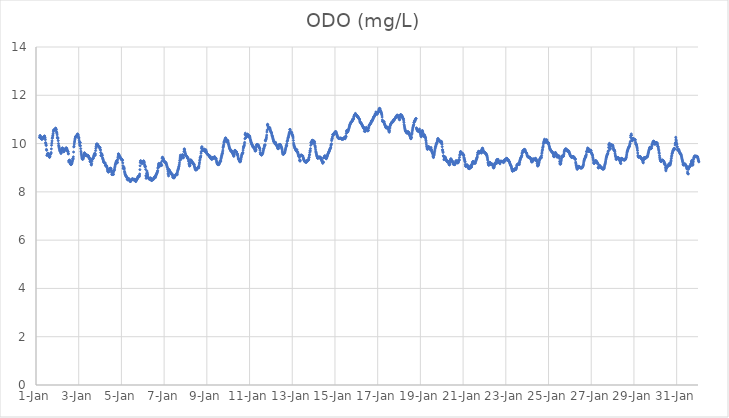
| Category | ODO (mg/L) |
|---|---|
| 44927.166666666664 | 10.25 |
| 44927.177083333336 | 10.27 |
| 44927.1875 | 10.33 |
| 44927.197916666664 | 10.33 |
| 44927.208333333336 | 10.29 |
| 44927.21875 | 10.25 |
| 44927.229166666664 | 10.24 |
| 44927.239583333336 | 10.22 |
| 44927.25 | 10.2 |
| 44927.260416666664 | 10.19 |
| 44927.270833333336 | 10.18 |
| 44927.28125 | 10.19 |
| 44927.291666666664 | 10.19 |
| 44927.302083333336 | 10.2 |
| 44927.3125 | 10.22 |
| 44927.322916666664 | 10.23 |
| 44927.333333333336 | 10.24 |
| 44927.34375 | 10.26 |
| 44927.354166666664 | 10.27 |
| 44927.364583333336 | 10.29 |
| 44927.375 | 10.29 |
| 44927.385416666664 | 10.28 |
| 44927.395833333336 | 10.31 |
| 44927.40625 | 10.31 |
| 44927.416666666664 | 10.26 |
| 44927.427083333336 | 10.23 |
| 44927.4375 | 10.16 |
| 44927.447916666664 | 10.04 |
| 44927.458333333336 | 10.01 |
| 44927.46875 | 9.95 |
| 44927.479166666664 | 9.92 |
| 44927.489583333336 | 9.76 |
| 44927.5 | 9.72 |
| 44927.510416666664 | 9.51 |
| 44927.520833333336 | 9.52 |
| 44927.53125 | 9.57 |
| 44927.541666666664 | 9.54 |
| 44927.552083333336 | 9.56 |
| 44927.5625 | 9.6 |
| 44927.572916666664 | 9.57 |
| 44927.583333333336 | 9.55 |
| 44927.59375 | 9.51 |
| 44927.604166666664 | 9.49 |
| 44927.614583333336 | 9.46 |
| 44927.625 | 9.44 |
| 44927.635416666664 | 9.43 |
| 44927.645833333336 | 9.45 |
| 44927.65625 | 9.48 |
| 44927.666666666664 | 9.54 |
| 44927.677083333336 | 9.57 |
| 44927.6875 | 9.59 |
| 44927.697916666664 | 9.58 |
| 44927.708333333336 | 9.63 |
| 44927.71875 | 9.78 |
| 44927.729166666664 | 9.93 |
| 44927.739583333336 | 10.02 |
| 44927.75 | 10.11 |
| 44927.760416666664 | 10.22 |
| 44927.770833333336 | 10.24 |
| 44927.78125 | 10.31 |
| 44927.791666666664 | 10.35 |
| 44927.802083333336 | 10.41 |
| 44927.8125 | 10.49 |
| 44927.822916666664 | 10.55 |
| 44927.833333333336 | 10.56 |
| 44927.84375 | 10.56 |
| 44927.854166666664 | 10.57 |
| 44927.864583333336 | 10.57 |
| 44927.875 | 10.58 |
| 44927.885416666664 | 10.59 |
| 44927.895833333336 | 10.61 |
| 44927.90625 | 10.6 |
| 44927.916666666664 | 10.64 |
| 44927.927083333336 | 10.63 |
| 44927.9375 | 10.58 |
| 44927.947916666664 | 10.58 |
| 44927.958333333336 | 10.5 |
| 44927.96875 | 10.45 |
| 44927.979166666664 | 10.43 |
| 44927.989583333336 | 10.36 |
| 44928.0 | 10.26 |
| 44928.010416666664 | 10.22 |
| 44928.020833333336 | 10.23 |
| 44928.03125 | 10.23 |
| 44928.041666666664 | 10.12 |
| 44928.052083333336 | 10 |
| 44928.0625 | 9.92 |
| 44928.072916666664 | 9.88 |
| 44928.083333333336 | 9.84 |
| 44928.09375 | 9.8 |
| 44928.104166666664 | 9.75 |
| 44928.114583333336 | 9.71 |
| 44928.125 | 9.69 |
| 44928.135416666664 | 9.67 |
| 44928.145833333336 | 9.67 |
| 44928.15625 | 9.66 |
| 44928.166666666664 | 9.59 |
| 44928.177083333336 | 9.61 |
| 44928.1875 | 9.63 |
| 44928.197916666664 | 9.74 |
| 44928.208333333336 | 9.75 |
| 44928.21875 | 9.8 |
| 44928.229166666664 | 9.81 |
| 44928.239583333336 | 9.82 |
| 44928.25 | 9.8 |
| 44928.260416666664 | 9.74 |
| 44928.270833333336 | 9.74 |
| 44928.28125 | 9.72 |
| 44928.291666666664 | 9.67 |
| 44928.302083333336 | 9.66 |
| 44928.3125 | 9.67 |
| 44928.322916666664 | 9.7 |
| 44928.333333333336 | 9.73 |
| 44928.34375 | 9.75 |
| 44928.354166666664 | 9.76 |
| 44928.364583333336 | 9.77 |
| 44928.375 | 9.77 |
| 44928.385416666664 | 9.79 |
| 44928.395833333336 | 9.81 |
| 44928.40625 | 9.81 |
| 44928.416666666664 | 9.82 |
| 44928.427083333336 | 9.81 |
| 44928.4375 | 9.8 |
| 44928.447916666664 | 9.71 |
| 44928.458333333336 | 9.76 |
| 44928.46875 | 9.71 |
| 44928.479166666664 | 9.68 |
| 44928.489583333336 | 9.66 |
| 44928.5 | 9.67 |
| 44928.510416666664 | 9.57 |
| 44928.520833333336 | 9.59 |
| 44928.53125 | 9.24 |
| 44928.541666666664 | 9.29 |
| 44928.552083333336 | 9.29 |
| 44928.5625 | 9.3 |
| 44928.572916666664 | 9.32 |
| 44928.583333333336 | 9.28 |
| 44928.59375 | 9.24 |
| 44928.604166666664 | 9.19 |
| 44928.614583333336 | 9.16 |
| 44928.625 | 9.14 |
| 44928.635416666664 | 9.13 |
| 44928.645833333336 | 9.13 |
| 44928.65625 | 9.14 |
| 44928.666666666664 | 9.16 |
| 44928.677083333336 | 9.17 |
| 44928.6875 | 9.23 |
| 44928.697916666664 | 9.25 |
| 44928.708333333336 | 9.3 |
| 44928.71875 | 9.38 |
| 44928.729166666664 | 9.35 |
| 44928.739583333336 | 9.37 |
| 44928.75 | 9.45 |
| 44928.760416666664 | 9.65 |
| 44928.770833333336 | 9.86 |
| 44928.78125 | 9.89 |
| 44928.791666666664 | 9.98 |
| 44928.802083333336 | 10.06 |
| 44928.8125 | 10.11 |
| 44928.822916666664 | 10.18 |
| 44928.833333333336 | 10.22 |
| 44928.84375 | 10.27 |
| 44928.854166666664 | 10.28 |
| 44928.864583333336 | 10.28 |
| 44928.875 | 10.3 |
| 44928.885416666664 | 10.32 |
| 44928.895833333336 | 10.31 |
| 44928.90625 | 10.31 |
| 44928.916666666664 | 10.33 |
| 44928.927083333336 | 10.36 |
| 44928.9375 | 10.38 |
| 44928.947916666664 | 10.4 |
| 44928.958333333336 | 10.38 |
| 44928.96875 | 10.37 |
| 44928.979166666664 | 10.32 |
| 44928.989583333336 | 10.27 |
| 44929.0 | 10.22 |
| 44929.010416666664 | 10.24 |
| 44929.020833333336 | 10.14 |
| 44929.03125 | 10.06 |
| 44929.041666666664 | 9.98 |
| 44929.052083333336 | 9.91 |
| 44929.0625 | 10.05 |
| 44929.072916666664 | 10.04 |
| 44929.083333333336 | 9.91 |
| 44929.09375 | 9.79 |
| 44929.104166666664 | 9.68 |
| 44929.114583333336 | 9.61 |
| 44929.125 | 9.55 |
| 44929.135416666664 | 9.49 |
| 44929.145833333336 | 9.44 |
| 44929.15625 | 9.39 |
| 44929.166666666664 | 9.36 |
| 44929.177083333336 | 9.35 |
| 44929.1875 | 9.36 |
| 44929.197916666664 | 9.37 |
| 44929.208333333336 | 9.36 |
| 44929.21875 | 9.41 |
| 44929.229166666664 | 9.45 |
| 44929.239583333336 | 9.51 |
| 44929.25 | 9.56 |
| 44929.260416666664 | 9.58 |
| 44929.270833333336 | 9.62 |
| 44929.28125 | 9.6 |
| 44929.291666666664 | 9.57 |
| 44929.302083333336 | 9.54 |
| 44929.3125 | 9.52 |
| 44929.322916666664 | 9.51 |
| 44929.333333333336 | 9.51 |
| 44929.34375 | 9.52 |
| 44929.354166666664 | 9.53 |
| 44929.364583333336 | 9.54 |
| 44929.375 | 9.49 |
| 44929.385416666664 | 9.5 |
| 44929.395833333336 | 9.51 |
| 44929.40625 | 9.51 |
| 44929.416666666664 | 9.51 |
| 44929.427083333336 | 9.51 |
| 44929.4375 | 9.5 |
| 44929.447916666664 | 9.49 |
| 44929.458333333336 | 9.48 |
| 44929.46875 | 9.41 |
| 44929.479166666664 | 9.43 |
| 44929.489583333336 | 9.43 |
| 44929.5 | 9.41 |
| 44929.510416666664 | 9.37 |
| 44929.520833333336 | 9.34 |
| 44929.53125 | 9.26 |
| 44929.541666666664 | 9.24 |
| 44929.552083333336 | 9.31 |
| 44929.5625 | 9.28 |
| 44929.572916666664 | 9.28 |
| 44929.583333333336 | 9.14 |
| 44929.59375 | 9.11 |
| 44929.604166666664 | 9.17 |
| 44929.614583333336 | 9.26 |
| 44929.625 | 9.33 |
| 44929.635416666664 | 9.37 |
| 44929.645833333336 | 9.37 |
| 44929.65625 | 9.36 |
| 44929.666666666664 | 9.37 |
| 44929.677083333336 | 9.39 |
| 44929.6875 | 9.41 |
| 44929.697916666664 | 9.46 |
| 44929.708333333336 | 9.49 |
| 44929.71875 | 9.52 |
| 44929.729166666664 | 9.54 |
| 44929.739583333336 | 9.57 |
| 44929.75 | 9.6 |
| 44929.760416666664 | 9.53 |
| 44929.770833333336 | 9.51 |
| 44929.78125 | 9.57 |
| 44929.791666666664 | 9.71 |
| 44929.802083333336 | 9.8 |
| 44929.8125 | 9.87 |
| 44929.822916666664 | 9.94 |
| 44929.833333333336 | 9.97 |
| 44929.84375 | 9.98 |
| 44929.854166666664 | 9.97 |
| 44929.864583333336 | 9.98 |
| 44929.875 | 9.97 |
| 44929.885416666664 | 9.96 |
| 44929.895833333336 | 9.94 |
| 44929.90625 | 9.9 |
| 44929.916666666664 | 9.89 |
| 44929.927083333336 | 9.88 |
| 44929.9375 | 9.87 |
| 44929.947916666664 | 9.87 |
| 44929.958333333336 | 9.86 |
| 44929.96875 | 9.85 |
| 44929.979166666664 | 9.82 |
| 44929.989583333336 | 9.83 |
| 44930.0 | 9.83 |
| 44930.010416666664 | 9.76 |
| 44930.020833333336 | 9.73 |
| 44930.03125 | 9.63 |
| 44930.041666666664 | 9.5 |
| 44930.052083333336 | 9.51 |
| 44930.0625 | 9.58 |
| 44930.072916666664 | 9.51 |
| 44930.083333333336 | 9.5 |
| 44930.09375 | 9.56 |
| 44930.104166666664 | 9.51 |
| 44930.114583333336 | 9.42 |
| 44930.125 | 9.38 |
| 44930.135416666664 | 9.35 |
| 44930.145833333336 | 9.32 |
| 44930.15625 | 9.28 |
| 44930.166666666664 | 9.25 |
| 44930.177083333336 | 9.23 |
| 44930.1875 | 9.21 |
| 44930.197916666664 | 9.2 |
| 44930.208333333336 | 9.2 |
| 44930.21875 | 9.2 |
| 44930.229166666664 | 9.19 |
| 44930.239583333336 | 9.19 |
| 44930.25 | 9.1 |
| 44930.260416666664 | 9.08 |
| 44930.270833333336 | 9.09 |
| 44930.28125 | 9.1 |
| 44930.291666666664 | 9.08 |
| 44930.302083333336 | 9.08 |
| 44930.3125 | 9.04 |
| 44930.322916666664 | 9.02 |
| 44930.333333333336 | 8.99 |
| 44930.34375 | 8.94 |
| 44930.354166666664 | 8.88 |
| 44930.364583333336 | 8.85 |
| 44930.375 | 8.83 |
| 44930.385416666664 | 8.82 |
| 44930.395833333336 | 8.83 |
| 44930.40625 | 8.84 |
| 44930.416666666664 | 8.87 |
| 44930.427083333336 | 8.9 |
| 44930.4375 | 8.91 |
| 44930.447916666664 | 8.94 |
| 44930.458333333336 | 8.96 |
| 44930.46875 | 8.97 |
| 44930.479166666664 | 8.97 |
| 44930.489583333336 | 8.98 |
| 44930.5 | 8.97 |
| 44930.510416666664 | 8.96 |
| 44930.520833333336 | 8.87 |
| 44930.53125 | 8.89 |
| 44930.541666666664 | 8.8 |
| 44930.552083333336 | 8.73 |
| 44930.5625 | 8.71 |
| 44930.572916666664 | 8.8 |
| 44930.583333333336 | 8.86 |
| 44930.59375 | 8.83 |
| 44930.604166666664 | 8.77 |
| 44930.614583333336 | 8.73 |
| 44930.625 | 8.72 |
| 44930.635416666664 | 8.83 |
| 44930.645833333336 | 8.87 |
| 44930.65625 | 8.88 |
| 44930.666666666664 | 8.9 |
| 44930.677083333336 | 8.94 |
| 44930.6875 | 9 |
| 44930.697916666664 | 9.06 |
| 44930.708333333336 | 9.11 |
| 44930.71875 | 9.14 |
| 44930.729166666664 | 9.16 |
| 44930.739583333336 | 9.2 |
| 44930.75 | 9.23 |
| 44930.760416666664 | 9.25 |
| 44930.770833333336 | 9.27 |
| 44930.78125 | 9.3 |
| 44930.791666666664 | 9.25 |
| 44930.802083333336 | 9.2 |
| 44930.8125 | 9.22 |
| 44930.822916666664 | 9.33 |
| 44930.833333333336 | 9.41 |
| 44930.84375 | 9.48 |
| 44930.854166666664 | 9.57 |
| 44930.864583333336 | 9.57 |
| 44930.875 | 9.55 |
| 44930.885416666664 | 9.53 |
| 44930.895833333336 | 9.51 |
| 44930.90625 | 9.48 |
| 44930.916666666664 | 9.46 |
| 44930.927083333336 | 9.45 |
| 44930.9375 | 9.43 |
| 44930.947916666664 | 9.42 |
| 44930.958333333336 | 9.41 |
| 44930.96875 | 9.4 |
| 44930.979166666664 | 9.38 |
| 44930.989583333336 | 9.35 |
| 44931.0 | 9.37 |
| 44931.010416666664 | 9.33 |
| 44931.020833333336 | 9.35 |
| 44931.03125 | 9.33 |
| 44931.041666666664 | 9.3 |
| 44931.052083333336 | 9.31 |
| 44931.0625 | 9.2 |
| 44931.072916666664 | 9.08 |
| 44931.083333333336 | 8.97 |
| 44931.09375 | 8.99 |
| 44931.104166666664 | 8.98 |
| 44931.114583333336 | 8.95 |
| 44931.125 | 9.02 |
| 44931.135416666664 | 8.95 |
| 44931.145833333336 | 8.85 |
| 44931.15625 | 8.8 |
| 44931.166666666664 | 8.76 |
| 44931.177083333336 | 8.72 |
| 44931.1875 | 8.7 |
| 44931.197916666664 | 8.68 |
| 44931.208333333336 | 8.66 |
| 44931.21875 | 8.65 |
| 44931.229166666664 | 8.63 |
| 44931.239583333336 | 8.63 |
| 44931.25 | 8.62 |
| 44931.260416666664 | 8.58 |
| 44931.270833333336 | 8.52 |
| 44931.28125 | 8.54 |
| 44931.291666666664 | 8.5 |
| 44931.302083333336 | 8.5 |
| 44931.3125 | 8.52 |
| 44931.322916666664 | 8.53 |
| 44931.333333333336 | 8.55 |
| 44931.34375 | 8.55 |
| 44931.354166666664 | 8.5 |
| 44931.364583333336 | 8.49 |
| 44931.375 | 8.49 |
| 44931.385416666664 | 8.48 |
| 44931.395833333336 | 8.46 |
| 44931.40625 | 8.44 |
| 44931.416666666664 | 8.43 |
| 44931.427083333336 | 8.43 |
| 44931.4375 | 8.44 |
| 44931.447916666664 | 8.47 |
| 44931.458333333336 | 8.49 |
| 44931.46875 | 8.51 |
| 44931.479166666664 | 8.52 |
| 44931.489583333336 | 8.52 |
| 44931.5 | 8.53 |
| 44931.510416666664 | 8.53 |
| 44931.520833333336 | 8.53 |
| 44931.53125 | 8.54 |
| 44931.541666666664 | 8.51 |
| 44931.552083333336 | 8.51 |
| 44931.5625 | 8.5 |
| 44931.572916666664 | 8.52 |
| 44931.583333333336 | 8.51 |
| 44931.59375 | 8.49 |
| 44931.604166666664 | 8.52 |
| 44931.614583333336 | 8.48 |
| 44931.625 | 8.51 |
| 44931.635416666664 | 8.5 |
| 44931.645833333336 | 8.48 |
| 44931.65625 | 8.46 |
| 44931.666666666664 | 8.43 |
| 44931.677083333336 | 8.43 |
| 44931.6875 | 8.48 |
| 44931.697916666664 | 8.53 |
| 44931.708333333336 | 8.5 |
| 44931.71875 | 8.5 |
| 44931.729166666664 | 8.52 |
| 44931.739583333336 | 8.54 |
| 44931.75 | 8.56 |
| 44931.760416666664 | 8.59 |
| 44931.770833333336 | 8.61 |
| 44931.78125 | 8.63 |
| 44931.791666666664 | 8.64 |
| 44931.802083333336 | 8.66 |
| 44931.8125 | 8.65 |
| 44931.822916666664 | 8.62 |
| 44931.833333333336 | 8.64 |
| 44931.84375 | 8.68 |
| 44931.854166666664 | 8.74 |
| 44931.864583333336 | 8.92 |
| 44931.875 | 9.08 |
| 44931.885416666664 | 9.21 |
| 44931.895833333336 | 9.28 |
| 44931.90625 | 9.29 |
| 44931.916666666664 | 9.24 |
| 44931.927083333336 | 9.21 |
| 44931.9375 | 9.2 |
| 44931.947916666664 | 9.21 |
| 44931.958333333336 | 9.19 |
| 44931.96875 | 9.18 |
| 44931.979166666664 | 9.19 |
| 44931.989583333336 | 9.2 |
| 44932.0 | 9.22 |
| 44932.010416666664 | 9.25 |
| 44932.020833333336 | 9.26 |
| 44932.03125 | 9.27 |
| 44932.041666666664 | 9.28 |
| 44932.052083333336 | 9.27 |
| 44932.0625 | 9.24 |
| 44932.072916666664 | 9.2 |
| 44932.083333333336 | 9.13 |
| 44932.09375 | 9.09 |
| 44932.104166666664 | 9.04 |
| 44932.114583333336 | 9.06 |
| 44932.125 | 9.04 |
| 44932.135416666664 | 8.93 |
| 44932.145833333336 | 8.67 |
| 44932.15625 | 8.56 |
| 44932.166666666664 | 8.63 |
| 44932.177083333336 | 8.76 |
| 44932.1875 | 8.64 |
| 44932.197916666664 | 8.86 |
| 44932.208333333336 | 8.79 |
| 44932.21875 | 8.74 |
| 44932.229166666664 | 8.7 |
| 44932.239583333336 | 8.64 |
| 44932.25 | 8.6 |
| 44932.260416666664 | 8.58 |
| 44932.270833333336 | 8.57 |
| 44932.28125 | 8.56 |
| 44932.291666666664 | 8.53 |
| 44932.302083333336 | 8.54 |
| 44932.3125 | 8.53 |
| 44932.322916666664 | 8.54 |
| 44932.333333333336 | 8.52 |
| 44932.34375 | 8.53 |
| 44932.354166666664 | 8.56 |
| 44932.364583333336 | 8.58 |
| 44932.375 | 8.56 |
| 44932.385416666664 | 8.52 |
| 44932.395833333336 | 8.49 |
| 44932.40625 | 8.47 |
| 44932.416666666664 | 8.47 |
| 44932.427083333336 | 8.48 |
| 44932.4375 | 8.5 |
| 44932.447916666664 | 8.51 |
| 44932.458333333336 | 8.52 |
| 44932.46875 | 8.52 |
| 44932.479166666664 | 8.51 |
| 44932.489583333336 | 8.51 |
| 44932.5 | 8.53 |
| 44932.510416666664 | 8.55 |
| 44932.520833333336 | 8.57 |
| 44932.53125 | 8.58 |
| 44932.541666666664 | 8.6 |
| 44932.552083333336 | 8.61 |
| 44932.5625 | 8.63 |
| 44932.572916666664 | 8.64 |
| 44932.583333333336 | 8.65 |
| 44932.59375 | 8.59 |
| 44932.604166666664 | 8.64 |
| 44932.614583333336 | 8.69 |
| 44932.625 | 8.7 |
| 44932.635416666664 | 8.72 |
| 44932.645833333336 | 8.74 |
| 44932.65625 | 8.77 |
| 44932.666666666664 | 8.78 |
| 44932.677083333336 | 8.81 |
| 44932.6875 | 8.85 |
| 44932.697916666664 | 8.88 |
| 44932.708333333336 | 8.98 |
| 44932.71875 | 9.01 |
| 44932.729166666664 | 9.07 |
| 44932.739583333336 | 9.14 |
| 44932.75 | 9.18 |
| 44932.760416666664 | 9.1 |
| 44932.770833333336 | 9.08 |
| 44932.78125 | 9.05 |
| 44932.791666666664 | 9.08 |
| 44932.802083333336 | 9.12 |
| 44932.8125 | 9.14 |
| 44932.822916666664 | 9.17 |
| 44932.833333333336 | 9.19 |
| 44932.84375 | 9.18 |
| 44932.854166666664 | 9.16 |
| 44932.864583333336 | 9.12 |
| 44932.875 | 9.09 |
| 44932.885416666664 | 9.1 |
| 44932.895833333336 | 9.27 |
| 44932.90625 | 9.39 |
| 44932.916666666664 | 9.43 |
| 44932.927083333336 | 9.43 |
| 44932.9375 | 9.41 |
| 44932.947916666664 | 9.39 |
| 44932.958333333336 | 9.37 |
| 44932.96875 | 9.34 |
| 44932.979166666664 | 9.31 |
| 44932.989583333336 | 9.28 |
| 44933.0 | 9.27 |
| 44933.010416666664 | 9.26 |
| 44933.020833333336 | 9.25 |
| 44933.03125 | 9.24 |
| 44933.041666666664 | 9.23 |
| 44933.052083333336 | 9.22 |
| 44933.0625 | 9.21 |
| 44933.072916666664 | 9.22 |
| 44933.083333333336 | 9.2 |
| 44933.09375 | 9.19 |
| 44933.104166666664 | 9.15 |
| 44933.114583333336 | 9.13 |
| 44933.125 | 9.1 |
| 44933.135416666664 | 9.05 |
| 44933.145833333336 | 9.02 |
| 44933.15625 | 9 |
| 44933.166666666664 | 8.93 |
| 44933.177083333336 | 8.86 |
| 44933.1875 | 8.77 |
| 44933.197916666664 | 8.72 |
| 44933.208333333336 | 8.66 |
| 44933.21875 | 8.94 |
| 44933.229166666664 | 8.89 |
| 44933.239583333336 | 8.91 |
| 44933.25 | 8.88 |
| 44933.260416666664 | 8.87 |
| 44933.270833333336 | 8.85 |
| 44933.28125 | 8.82 |
| 44933.291666666664 | 8.81 |
| 44933.302083333336 | 8.8 |
| 44933.3125 | 8.78 |
| 44933.322916666664 | 8.78 |
| 44933.333333333336 | 8.74 |
| 44933.34375 | 8.75 |
| 44933.354166666664 | 8.72 |
| 44933.364583333336 | 8.73 |
| 44933.375 | 8.74 |
| 44933.385416666664 | 8.71 |
| 44933.395833333336 | 8.67 |
| 44933.40625 | 8.62 |
| 44933.416666666664 | 8.6 |
| 44933.427083333336 | 8.6 |
| 44933.4375 | 8.59 |
| 44933.447916666664 | 8.59 |
| 44933.458333333336 | 8.58 |
| 44933.46875 | 8.58 |
| 44933.479166666664 | 8.6 |
| 44933.489583333336 | 8.62 |
| 44933.5 | 8.65 |
| 44933.510416666664 | 8.66 |
| 44933.520833333336 | 8.68 |
| 44933.53125 | 8.68 |
| 44933.541666666664 | 8.7 |
| 44933.552083333336 | 8.71 |
| 44933.5625 | 8.73 |
| 44933.572916666664 | 8.73 |
| 44933.583333333336 | 8.75 |
| 44933.59375 | 8.77 |
| 44933.604166666664 | 8.76 |
| 44933.614583333336 | 8.71 |
| 44933.625 | 8.82 |
| 44933.635416666664 | 8.87 |
| 44933.645833333336 | 8.9 |
| 44933.65625 | 8.93 |
| 44933.666666666664 | 8.96 |
| 44933.677083333336 | 8.99 |
| 44933.6875 | 9.04 |
| 44933.697916666664 | 9.07 |
| 44933.708333333336 | 9.12 |
| 44933.71875 | 9.2 |
| 44933.729166666664 | 9.29 |
| 44933.739583333336 | 9.36 |
| 44933.75 | 9.44 |
| 44933.760416666664 | 9.52 |
| 44933.770833333336 | 9.45 |
| 44933.78125 | 9.34 |
| 44933.791666666664 | 9.37 |
| 44933.802083333336 | 9.39 |
| 44933.8125 | 9.44 |
| 44933.822916666664 | 9.46 |
| 44933.833333333336 | 9.49 |
| 44933.84375 | 9.52 |
| 44933.854166666664 | 9.54 |
| 44933.864583333336 | 9.52 |
| 44933.875 | 9.5 |
| 44933.885416666664 | 9.47 |
| 44933.895833333336 | 9.41 |
| 44933.90625 | 9.42 |
| 44933.916666666664 | 9.51 |
| 44933.927083333336 | 9.67 |
| 44933.9375 | 9.77 |
| 44933.947916666664 | 9.78 |
| 44933.958333333336 | 9.74 |
| 44933.96875 | 9.68 |
| 44933.979166666664 | 9.63 |
| 44933.989583333336 | 9.59 |
| 44934.0 | 9.56 |
| 44934.010416666664 | 9.53 |
| 44934.020833333336 | 9.51 |
| 44934.03125 | 9.5 |
| 44934.041666666664 | 9.49 |
| 44934.052083333336 | 9.48 |
| 44934.0625 | 9.47 |
| 44934.072916666664 | 9.46 |
| 44934.083333333336 | 9.43 |
| 44934.09375 | 9.4 |
| 44934.104166666664 | 9.41 |
| 44934.114583333336 | 9.4 |
| 44934.125 | 9.38 |
| 44934.135416666664 | 9.34 |
| 44934.145833333336 | 9.28 |
| 44934.15625 | 9.25 |
| 44934.166666666664 | 9.17 |
| 44934.177083333336 | 9.13 |
| 44934.1875 | 9.07 |
| 44934.197916666664 | 9.09 |
| 44934.208333333336 | 9.08 |
| 44934.21875 | 9.18 |
| 44934.229166666664 | 9.17 |
| 44934.239583333336 | 9.32 |
| 44934.25 | 9.32 |
| 44934.260416666664 | 9.31 |
| 44934.270833333336 | 9.3 |
| 44934.28125 | 9.29 |
| 44934.291666666664 | 9.27 |
| 44934.302083333336 | 9.26 |
| 44934.3125 | 9.23 |
| 44934.322916666664 | 9.22 |
| 44934.333333333336 | 9.21 |
| 44934.34375 | 9.2 |
| 44934.354166666664 | 9.18 |
| 44934.364583333336 | 9.18 |
| 44934.375 | 9.14 |
| 44934.385416666664 | 9.13 |
| 44934.395833333336 | 9.15 |
| 44934.40625 | 9.13 |
| 44934.416666666664 | 9.07 |
| 44934.427083333336 | 9.04 |
| 44934.4375 | 9 |
| 44934.447916666664 | 8.96 |
| 44934.458333333336 | 8.94 |
| 44934.46875 | 8.92 |
| 44934.479166666664 | 8.91 |
| 44934.489583333336 | 8.91 |
| 44934.5 | 8.92 |
| 44934.510416666664 | 8.92 |
| 44934.520833333336 | 8.92 |
| 44934.53125 | 8.94 |
| 44934.541666666664 | 8.96 |
| 44934.552083333336 | 8.97 |
| 44934.5625 | 8.98 |
| 44934.572916666664 | 8.99 |
| 44934.583333333336 | 9 |
| 44934.59375 | 9.02 |
| 44934.604166666664 | 9.03 |
| 44934.614583333336 | 9.05 |
| 44934.625 | 8.99 |
| 44934.635416666664 | 9.07 |
| 44934.645833333336 | 9.15 |
| 44934.65625 | 9.21 |
| 44934.666666666664 | 9.29 |
| 44934.677083333336 | 9.35 |
| 44934.6875 | 9.41 |
| 44934.697916666664 | 9.42 |
| 44934.708333333336 | 9.45 |
| 44934.71875 | 9.49 |
| 44934.729166666664 | 9.6 |
| 44934.739583333336 | 9.67 |
| 44934.75 | 9.8 |
| 44934.760416666664 | 9.85 |
| 44934.770833333336 | 9.87 |
| 44934.78125 | 9.81 |
| 44934.791666666664 | 9.76 |
| 44934.802083333336 | 9.72 |
| 44934.8125 | 9.71 |
| 44934.822916666664 | 9.72 |
| 44934.833333333336 | 9.73 |
| 44934.84375 | 9.75 |
| 44934.854166666664 | 9.75 |
| 44934.864583333336 | 9.77 |
| 44934.875 | 9.77 |
| 44934.885416666664 | 9.75 |
| 44934.895833333336 | 9.73 |
| 44934.90625 | 9.7 |
| 44934.916666666664 | 9.67 |
| 44934.927083333336 | 9.67 |
| 44934.9375 | 9.71 |
| 44934.947916666664 | 9.75 |
| 44934.958333333336 | 9.72 |
| 44934.96875 | 9.68 |
| 44934.979166666664 | 9.65 |
| 44934.989583333336 | 9.61 |
| 44935.0 | 9.59 |
| 44935.010416666664 | 9.57 |
| 44935.020833333336 | 9.57 |
| 44935.03125 | 9.55 |
| 44935.041666666664 | 9.55 |
| 44935.052083333336 | 9.55 |
| 44935.0625 | 9.54 |
| 44935.072916666664 | 9.53 |
| 44935.083333333336 | 9.52 |
| 44935.09375 | 9.5 |
| 44935.104166666664 | 9.48 |
| 44935.114583333336 | 9.49 |
| 44935.125 | 9.45 |
| 44935.135416666664 | 9.45 |
| 44935.145833333336 | 9.47 |
| 44935.15625 | 9.48 |
| 44935.166666666664 | 9.4 |
| 44935.177083333336 | 9.42 |
| 44935.1875 | 9.39 |
| 44935.197916666664 | 9.37 |
| 44935.208333333336 | 9.38 |
| 44935.21875 | 9.38 |
| 44935.229166666664 | 9.34 |
| 44935.239583333336 | 9.37 |
| 44935.25 | 9.42 |
| 44935.260416666664 | 9.37 |
| 44935.270833333336 | 9.42 |
| 44935.28125 | 9.41 |
| 44935.291666666664 | 9.41 |
| 44935.302083333336 | 9.39 |
| 44935.3125 | 9.4 |
| 44935.322916666664 | 9.43 |
| 44935.333333333336 | 9.42 |
| 44935.34375 | 9.43 |
| 44935.354166666664 | 9.43 |
| 44935.364583333336 | 9.46 |
| 44935.375 | 9.41 |
| 44935.385416666664 | 9.38 |
| 44935.395833333336 | 9.39 |
| 44935.40625 | 9.39 |
| 44935.416666666664 | 9.39 |
| 44935.427083333336 | 9.39 |
| 44935.4375 | 9.36 |
| 44935.447916666664 | 9.3 |
| 44935.458333333336 | 9.25 |
| 44935.46875 | 9.22 |
| 44935.479166666664 | 9.19 |
| 44935.489583333336 | 9.17 |
| 44935.5 | 9.15 |
| 44935.510416666664 | 9.13 |
| 44935.520833333336 | 9.13 |
| 44935.53125 | 9.13 |
| 44935.541666666664 | 9.13 |
| 44935.552083333336 | 9.13 |
| 44935.5625 | 9.14 |
| 44935.572916666664 | 9.15 |
| 44935.583333333336 | 9.18 |
| 44935.59375 | 9.2 |
| 44935.604166666664 | 9.22 |
| 44935.614583333336 | 9.25 |
| 44935.625 | 9.28 |
| 44935.635416666664 | 9.28 |
| 44935.645833333336 | 9.26 |
| 44935.65625 | 9.32 |
| 44935.666666666664 | 9.38 |
| 44935.677083333336 | 9.42 |
| 44935.6875 | 9.47 |
| 44935.697916666664 | 9.51 |
| 44935.708333333336 | 9.55 |
| 44935.71875 | 9.58 |
| 44935.729166666664 | 9.6 |
| 44935.739583333336 | 9.66 |
| 44935.75 | 9.73 |
| 44935.760416666664 | 9.83 |
| 44935.770833333336 | 9.87 |
| 44935.78125 | 9.91 |
| 44935.791666666664 | 9.97 |
| 44935.802083333336 | 10.05 |
| 44935.8125 | 10.09 |
| 44935.822916666664 | 10.07 |
| 44935.833333333336 | 10.11 |
| 44935.84375 | 10.15 |
| 44935.854166666664 | 10.18 |
| 44935.864583333336 | 10.21 |
| 44935.875 | 10.23 |
| 44935.885416666664 | 10.23 |
| 44935.895833333336 | 10.21 |
| 44935.90625 | 10.17 |
| 44935.916666666664 | 10.14 |
| 44935.927083333336 | 10.08 |
| 44935.9375 | 10.07 |
| 44935.947916666664 | 10.1 |
| 44935.958333333336 | 10.12 |
| 44935.96875 | 10.13 |
| 44935.979166666664 | 10.13 |
| 44935.989583333336 | 10.1 |
| 44936.0 | 10.05 |
| 44936.010416666664 | 9.99 |
| 44936.020833333336 | 9.96 |
| 44936.03125 | 9.92 |
| 44936.041666666664 | 9.88 |
| 44936.052083333336 | 9.85 |
| 44936.0625 | 9.81 |
| 44936.072916666664 | 9.79 |
| 44936.083333333336 | 9.77 |
| 44936.09375 | 9.75 |
| 44936.104166666664 | 9.73 |
| 44936.114583333336 | 9.72 |
| 44936.125 | 9.69 |
| 44936.135416666664 | 9.69 |
| 44936.145833333336 | 9.68 |
| 44936.15625 | 9.66 |
| 44936.166666666664 | 9.7 |
| 44936.177083333336 | 9.68 |
| 44936.1875 | 9.66 |
| 44936.197916666664 | 9.61 |
| 44936.208333333336 | 9.59 |
| 44936.21875 | 9.57 |
| 44936.229166666664 | 9.57 |
| 44936.239583333336 | 9.53 |
| 44936.25 | 9.52 |
| 44936.260416666664 | 9.47 |
| 44936.270833333336 | 9.5 |
| 44936.28125 | 9.57 |
| 44936.291666666664 | 9.63 |
| 44936.302083333336 | 9.68 |
| 44936.3125 | 9.72 |
| 44936.322916666664 | 9.71 |
| 44936.333333333336 | 9.71 |
| 44936.34375 | 9.69 |
| 44936.354166666664 | 9.66 |
| 44936.364583333336 | 9.65 |
| 44936.375 | 9.66 |
| 44936.385416666664 | 9.66 |
| 44936.395833333336 | 9.65 |
| 44936.40625 | 9.56 |
| 44936.416666666664 | 9.56 |
| 44936.427083333336 | 9.56 |
| 44936.4375 | 9.57 |
| 44936.447916666664 | 9.51 |
| 44936.458333333336 | 9.45 |
| 44936.46875 | 9.4 |
| 44936.479166666664 | 9.36 |
| 44936.489583333336 | 9.37 |
| 44936.5 | 9.35 |
| 44936.510416666664 | 9.32 |
| 44936.520833333336 | 9.29 |
| 44936.53125 | 9.27 |
| 44936.541666666664 | 9.25 |
| 44936.552083333336 | 9.24 |
| 44936.5625 | 9.25 |
| 44936.572916666664 | 9.26 |
| 44936.583333333336 | 9.28 |
| 44936.59375 | 9.34 |
| 44936.604166666664 | 9.4 |
| 44936.614583333336 | 9.44 |
| 44936.625 | 9.49 |
| 44936.635416666664 | 9.53 |
| 44936.645833333336 | 9.56 |
| 44936.65625 | 9.58 |
| 44936.666666666664 | 9.61 |
| 44936.677083333336 | 9.59 |
| 44936.6875 | 9.63 |
| 44936.697916666664 | 9.73 |
| 44936.708333333336 | 9.81 |
| 44936.71875 | 9.87 |
| 44936.729166666664 | 9.86 |
| 44936.739583333336 | 9.9 |
| 44936.75 | 9.91 |
| 44936.760416666664 | 9.98 |
| 44936.770833333336 | 10.05 |
| 44936.78125 | 10.2 |
| 44936.791666666664 | 10.37 |
| 44936.802083333336 | 10.43 |
| 44936.8125 | 10.36 |
| 44936.822916666664 | 10.24 |
| 44936.833333333336 | 10.26 |
| 44936.84375 | 10.28 |
| 44936.854166666664 | 10.31 |
| 44936.864583333336 | 10.35 |
| 44936.875 | 10.36 |
| 44936.885416666664 | 10.37 |
| 44936.895833333336 | 10.38 |
| 44936.90625 | 10.39 |
| 44936.916666666664 | 10.37 |
| 44936.927083333336 | 10.34 |
| 44936.9375 | 10.31 |
| 44936.947916666664 | 10.28 |
| 44936.958333333336 | 10.28 |
| 44936.96875 | 10.28 |
| 44936.979166666664 | 10.29 |
| 44936.989583333336 | 10.33 |
| 44937.0 | 10.31 |
| 44937.010416666664 | 10.28 |
| 44937.020833333336 | 10.24 |
| 44937.03125 | 10.19 |
| 44937.041666666664 | 10.15 |
| 44937.052083333336 | 10.12 |
| 44937.0625 | 10.09 |
| 44937.072916666664 | 10.05 |
| 44937.083333333336 | 10.03 |
| 44937.09375 | 10 |
| 44937.104166666664 | 9.97 |
| 44937.114583333336 | 9.95 |
| 44937.125 | 9.94 |
| 44937.135416666664 | 9.92 |
| 44937.145833333336 | 9.9 |
| 44937.15625 | 9.88 |
| 44937.166666666664 | 9.85 |
| 44937.177083333336 | 9.85 |
| 44937.1875 | 9.84 |
| 44937.197916666664 | 9.87 |
| 44937.208333333336 | 9.84 |
| 44937.21875 | 9.82 |
| 44937.229166666664 | 9.8 |
| 44937.239583333336 | 9.76 |
| 44937.25 | 9.74 |
| 44937.260416666664 | 9.69 |
| 44937.270833333336 | 9.71 |
| 44937.28125 | 9.7 |
| 44937.291666666664 | 9.71 |
| 44937.302083333336 | 9.76 |
| 44937.3125 | 9.85 |
| 44937.322916666664 | 9.93 |
| 44937.333333333336 | 9.94 |
| 44937.34375 | 9.96 |
| 44937.354166666664 | 9.96 |
| 44937.364583333336 | 9.96 |
| 44937.375 | 9.95 |
| 44937.385416666664 | 9.95 |
| 44937.395833333336 | 9.94 |
| 44937.40625 | 9.92 |
| 44937.416666666664 | 9.93 |
| 44937.427083333336 | 9.89 |
| 44937.4375 | 9.89 |
| 44937.447916666664 | 9.85 |
| 44937.458333333336 | 9.83 |
| 44937.46875 | 9.81 |
| 44937.479166666664 | 9.79 |
| 44937.489583333336 | 9.73 |
| 44937.5 | 9.63 |
| 44937.510416666664 | 9.56 |
| 44937.520833333336 | 9.57 |
| 44937.53125 | 9.56 |
| 44937.541666666664 | 9.54 |
| 44937.552083333336 | 9.53 |
| 44937.5625 | 9.53 |
| 44937.572916666664 | 9.53 |
| 44937.583333333336 | 9.54 |
| 44937.59375 | 9.57 |
| 44937.604166666664 | 9.59 |
| 44937.614583333336 | 9.6 |
| 44937.625 | 9.62 |
| 44937.635416666664 | 9.67 |
| 44937.645833333336 | 9.72 |
| 44937.65625 | 9.78 |
| 44937.666666666664 | 9.79 |
| 44937.677083333336 | 9.82 |
| 44937.6875 | 9.86 |
| 44937.697916666664 | 9.93 |
| 44937.708333333336 | 9.9 |
| 44937.71875 | 9.93 |
| 44937.729166666664 | 9.95 |
| 44937.739583333336 | 10.13 |
| 44937.75 | 10.11 |
| 44937.760416666664 | 10.15 |
| 44937.770833333336 | 10.17 |
| 44937.78125 | 10.22 |
| 44937.791666666664 | 10.27 |
| 44937.802083333336 | 10.35 |
| 44937.8125 | 10.48 |
| 44937.822916666664 | 10.56 |
| 44937.833333333336 | 10.77 |
| 44937.84375 | 10.8 |
| 44937.854166666664 | 10.78 |
| 44937.864583333336 | 10.72 |
| 44937.875 | 10.65 |
| 44937.885416666664 | 10.63 |
| 44937.895833333336 | 10.61 |
| 44937.90625 | 10.63 |
| 44937.916666666664 | 10.65 |
| 44937.927083333336 | 10.67 |
| 44937.9375 | 10.66 |
| 44937.947916666664 | 10.65 |
| 44937.958333333336 | 10.62 |
| 44937.96875 | 10.57 |
| 44937.979166666664 | 10.54 |
| 44937.989583333336 | 10.5 |
| 44938.0 | 10.49 |
| 44938.010416666664 | 10.47 |
| 44938.020833333336 | 10.45 |
| 44938.03125 | 10.44 |
| 44938.041666666664 | 10.39 |
| 44938.052083333336 | 10.33 |
| 44938.0625 | 10.31 |
| 44938.072916666664 | 10.3 |
| 44938.083333333336 | 10.25 |
| 44938.09375 | 10.21 |
| 44938.104166666664 | 10.18 |
| 44938.114583333336 | 10.15 |
| 44938.125 | 10.11 |
| 44938.135416666664 | 10.08 |
| 44938.145833333336 | 10.07 |
| 44938.15625 | 10.06 |
| 44938.166666666664 | 10.05 |
| 44938.177083333336 | 10.03 |
| 44938.1875 | 10.02 |
| 44938.197916666664 | 9.98 |
| 44938.208333333336 | 10.02 |
| 44938.21875 | 10.05 |
| 44938.229166666664 | 10.01 |
| 44938.239583333336 | 9.97 |
| 44938.25 | 9.96 |
| 44938.260416666664 | 9.93 |
| 44938.270833333336 | 9.91 |
| 44938.28125 | 9.92 |
| 44938.291666666664 | 9.89 |
| 44938.302083333336 | 9.86 |
| 44938.3125 | 9.84 |
| 44938.322916666664 | 9.79 |
| 44938.333333333336 | 9.79 |
| 44938.34375 | 9.82 |
| 44938.354166666664 | 9.79 |
| 44938.364583333336 | 9.87 |
| 44938.375 | 9.91 |
| 44938.385416666664 | 9.95 |
| 44938.395833333336 | 9.96 |
| 44938.40625 | 9.96 |
| 44938.416666666664 | 9.96 |
| 44938.427083333336 | 9.97 |
| 44938.4375 | 9.96 |
| 44938.447916666664 | 9.93 |
| 44938.458333333336 | 9.92 |
| 44938.46875 | 9.9 |
| 44938.479166666664 | 9.87 |
| 44938.489583333336 | 9.85 |
| 44938.5 | 9.83 |
| 44938.510416666664 | 9.8 |
| 44938.520833333336 | 9.75 |
| 44938.53125 | 9.69 |
| 44938.541666666664 | 9.64 |
| 44938.552083333336 | 9.6 |
| 44938.5625 | 9.56 |
| 44938.572916666664 | 9.56 |
| 44938.583333333336 | 9.57 |
| 44938.59375 | 9.56 |
| 44938.604166666664 | 9.57 |
| 44938.614583333336 | 9.59 |
| 44938.625 | 9.6 |
| 44938.635416666664 | 9.62 |
| 44938.645833333336 | 9.63 |
| 44938.65625 | 9.66 |
| 44938.666666666664 | 9.7 |
| 44938.677083333336 | 9.74 |
| 44938.6875 | 9.78 |
| 44938.697916666664 | 9.82 |
| 44938.708333333336 | 9.86 |
| 44938.71875 | 9.93 |
| 44938.729166666664 | 9.91 |
| 44938.739583333336 | 9.91 |
| 44938.75 | 10 |
| 44938.760416666664 | 10.09 |
| 44938.770833333336 | 10.12 |
| 44938.78125 | 10.13 |
| 44938.791666666664 | 10.19 |
| 44938.802083333336 | 10.23 |
| 44938.8125 | 10.25 |
| 44938.822916666664 | 10.28 |
| 44938.833333333336 | 10.33 |
| 44938.84375 | 10.37 |
| 44938.854166666664 | 10.41 |
| 44938.864583333336 | 10.45 |
| 44938.875 | 10.48 |
| 44938.885416666664 | 10.58 |
| 44938.895833333336 | 10.59 |
| 44938.90625 | 10.52 |
| 44938.916666666664 | 10.48 |
| 44938.927083333336 | 10.47 |
| 44938.9375 | 10.48 |
| 44938.947916666664 | 10.47 |
| 44938.958333333336 | 10.46 |
| 44938.96875 | 10.46 |
| 44938.979166666664 | 10.44 |
| 44938.989583333336 | 10.39 |
| 44939.0 | 10.38 |
| 44939.010416666664 | 10.34 |
| 44939.020833333336 | 10.32 |
| 44939.03125 | 10.28 |
| 44939.041666666664 | 10.23 |
| 44939.052083333336 | 10.13 |
| 44939.0625 | 10.02 |
| 44939.072916666664 | 9.95 |
| 44939.083333333336 | 9.93 |
| 44939.09375 | 9.89 |
| 44939.104166666664 | 9.87 |
| 44939.114583333336 | 9.83 |
| 44939.125 | 9.81 |
| 44939.135416666664 | 9.8 |
| 44939.145833333336 | 9.78 |
| 44939.15625 | 9.76 |
| 44939.166666666664 | 9.73 |
| 44939.177083333336 | 9.72 |
| 44939.1875 | 9.7 |
| 44939.197916666664 | 9.69 |
| 44939.208333333336 | 9.69 |
| 44939.21875 | 9.75 |
| 44939.229166666664 | 9.68 |
| 44939.239583333336 | 9.64 |
| 44939.25 | 9.66 |
| 44939.260416666664 | 9.62 |
| 44939.270833333336 | 9.59 |
| 44939.28125 | 9.55 |
| 44939.291666666664 | 9.5 |
| 44939.302083333336 | 9.48 |
| 44939.3125 | 9.48 |
| 44939.322916666664 | 9.5 |
| 44939.333333333336 | 9.42 |
| 44939.34375 | 9.31 |
| 44939.354166666664 | 9.31 |
| 44939.364583333336 | 9.27 |
| 44939.375 | 9.31 |
| 44939.385416666664 | 9.49 |
| 44939.395833333336 | 9.51 |
| 44939.40625 | 9.52 |
| 44939.416666666664 | 9.52 |
| 44939.427083333336 | 9.52 |
| 44939.4375 | 9.51 |
| 44939.447916666664 | 9.51 |
| 44939.458333333336 | 9.5 |
| 44939.46875 | 9.49 |
| 44939.479166666664 | 9.48 |
| 44939.489583333336 | 9.48 |
| 44939.5 | 9.48 |
| 44939.510416666664 | 9.41 |
| 44939.520833333336 | 9.4 |
| 44939.53125 | 9.36 |
| 44939.541666666664 | 9.34 |
| 44939.552083333336 | 9.31 |
| 44939.5625 | 9.3 |
| 44939.572916666664 | 9.28 |
| 44939.583333333336 | 9.25 |
| 44939.59375 | 9.26 |
| 44939.604166666664 | 9.26 |
| 44939.614583333336 | 9.24 |
| 44939.625 | 9.24 |
| 44939.635416666664 | 9.23 |
| 44939.645833333336 | 9.23 |
| 44939.65625 | 9.23 |
| 44939.666666666664 | 9.23 |
| 44939.677083333336 | 9.27 |
| 44939.6875 | 9.27 |
| 44939.697916666664 | 9.29 |
| 44939.708333333336 | 9.3 |
| 44939.71875 | 9.32 |
| 44939.729166666664 | 9.31 |
| 44939.739583333336 | 9.3 |
| 44939.75 | 9.32 |
| 44939.760416666664 | 9.32 |
| 44939.770833333336 | 9.35 |
| 44939.78125 | 9.42 |
| 44939.791666666664 | 9.44 |
| 44939.802083333336 | 9.52 |
| 44939.8125 | 9.55 |
| 44939.822916666664 | 9.64 |
| 44939.833333333336 | 9.71 |
| 44939.84375 | 9.69 |
| 44939.854166666664 | 9.79 |
| 44939.864583333336 | 9.93 |
| 44939.875 | 10.05 |
| 44939.885416666664 | 10.04 |
| 44939.895833333336 | 10.03 |
| 44939.90625 | 10 |
| 44939.916666666664 | 10.08 |
| 44939.927083333336 | 10.13 |
| 44939.9375 | 10.14 |
| 44939.947916666664 | 10.1 |
| 44939.958333333336 | 10.09 |
| 44939.96875 | 10.06 |
| 44939.979166666664 | 10 |
| 44939.989583333336 | 10.11 |
| 44940.0 | 10.11 |
| 44940.010416666664 | 10.11 |
| 44940.020833333336 | 10.09 |
| 44940.03125 | 10.08 |
| 44940.041666666664 | 10.07 |
| 44940.052083333336 | 10.01 |
| 44940.0625 | 9.92 |
| 44940.072916666664 | 9.88 |
| 44940.083333333336 | 9.82 |
| 44940.09375 | 9.74 |
| 44940.104166666664 | 9.66 |
| 44940.114583333336 | 9.64 |
| 44940.125 | 9.6 |
| 44940.135416666664 | 9.55 |
| 44940.145833333336 | 9.51 |
| 44940.15625 | 9.47 |
| 44940.166666666664 | 9.45 |
| 44940.177083333336 | 9.41 |
| 44940.1875 | 9.4 |
| 44940.197916666664 | 9.39 |
| 44940.208333333336 | 9.4 |
| 44940.21875 | 9.42 |
| 44940.229166666664 | 9.42 |
| 44940.239583333336 | 9.44 |
| 44940.25 | 9.45 |
| 44940.260416666664 | 9.44 |
| 44940.270833333336 | 9.4 |
| 44940.28125 | 9.43 |
| 44940.291666666664 | 9.42 |
| 44940.302083333336 | 9.44 |
| 44940.3125 | 9.43 |
| 44940.322916666664 | 9.43 |
| 44940.333333333336 | 9.4 |
| 44940.34375 | 9.38 |
| 44940.354166666664 | 9.36 |
| 44940.364583333336 | 9.34 |
| 44940.375 | 9.31 |
| 44940.385416666664 | 9.29 |
| 44940.395833333336 | 9.27 |
| 44940.40625 | 9.25 |
| 44940.416666666664 | 9.23 |
| 44940.427083333336 | 9.18 |
| 44940.4375 | 9.22 |
| 44940.447916666664 | 9.22 |
| 44940.458333333336 | 9.24 |
| 44940.46875 | 9.41 |
| 44940.479166666664 | 9.41 |
| 44940.489583333336 | 9.42 |
| 44940.5 | 9.45 |
| 44940.510416666664 | 9.47 |
| 44940.520833333336 | 9.49 |
| 44940.53125 | 9.49 |
| 44940.541666666664 | 9.48 |
| 44940.552083333336 | 9.44 |
| 44940.5625 | 9.43 |
| 44940.572916666664 | 9.41 |
| 44940.583333333336 | 9.38 |
| 44940.59375 | 9.37 |
| 44940.604166666664 | 9.4 |
| 44940.614583333336 | 9.43 |
| 44940.625 | 9.45 |
| 44940.635416666664 | 9.48 |
| 44940.645833333336 | 9.5 |
| 44940.65625 | 9.53 |
| 44940.666666666664 | 9.56 |
| 44940.677083333336 | 9.59 |
| 44940.6875 | 9.6 |
| 44940.697916666664 | 9.63 |
| 44940.708333333336 | 9.64 |
| 44940.71875 | 9.67 |
| 44940.729166666664 | 9.68 |
| 44940.739583333336 | 9.71 |
| 44940.75 | 9.74 |
| 44940.760416666664 | 9.76 |
| 44940.770833333336 | 9.78 |
| 44940.78125 | 9.8 |
| 44940.791666666664 | 9.82 |
| 44940.802083333336 | 9.85 |
| 44940.8125 | 9.92 |
| 44940.822916666664 | 9.96 |
| 44940.833333333336 | 9.99 |
| 44940.84375 | 10.12 |
| 44940.854166666664 | 10.18 |
| 44940.864583333336 | 10.2 |
| 44940.875 | 10.23 |
| 44940.885416666664 | 10.29 |
| 44940.895833333336 | 10.37 |
| 44940.90625 | 10.38 |
| 44940.916666666664 | 10.37 |
| 44940.927083333336 | 10.37 |
| 44940.9375 | 10.4 |
| 44940.947916666664 | 10.42 |
| 44940.958333333336 | 10.38 |
| 44940.96875 | 10.4 |
| 44940.979166666664 | 10.42 |
| 44940.989583333336 | 10.46 |
| 44941.0 | 10.47 |
| 44941.010416666664 | 10.48 |
| 44941.020833333336 | 10.49 |
| 44941.03125 | 10.5 |
| 44941.041666666664 | 10.48 |
| 44941.052083333336 | 10.48 |
| 44941.0625 | 10.44 |
| 44941.072916666664 | 10.42 |
| 44941.083333333336 | 10.39 |
| 44941.09375 | 10.36 |
| 44941.104166666664 | 10.34 |
| 44941.114583333336 | 10.3 |
| 44941.125 | 10.28 |
| 44941.135416666664 | 10.26 |
| 44941.145833333336 | 10.24 |
| 44941.15625 | 10.22 |
| 44941.166666666664 | 10.22 |
| 44941.177083333336 | 10.22 |
| 44941.1875 | 10.22 |
| 44941.197916666664 | 10.22 |
| 44941.208333333336 | 10.22 |
| 44941.21875 | 10.21 |
| 44941.229166666664 | 10.21 |
| 44941.239583333336 | 10.21 |
| 44941.25 | 10.22 |
| 44941.260416666664 | 10.22 |
| 44941.270833333336 | 10.22 |
| 44941.28125 | 10.22 |
| 44941.291666666664 | 10.22 |
| 44941.302083333336 | 10.21 |
| 44941.3125 | 10.19 |
| 44941.322916666664 | 10.18 |
| 44941.333333333336 | 10.18 |
| 44941.34375 | 10.19 |
| 44941.354166666664 | 10.19 |
| 44941.364583333336 | 10.2 |
| 44941.375 | 10.2 |
| 44941.385416666664 | 10.19 |
| 44941.395833333336 | 10.19 |
| 44941.40625 | 10.2 |
| 44941.416666666664 | 10.24 |
| 44941.427083333336 | 10.24 |
| 44941.4375 | 10.24 |
| 44941.447916666664 | 10.22 |
| 44941.458333333336 | 10.22 |
| 44941.46875 | 10.24 |
| 44941.479166666664 | 10.2 |
| 44941.489583333336 | 10.28 |
| 44941.5 | 10.3 |
| 44941.510416666664 | 10.31 |
| 44941.520833333336 | 10.28 |
| 44941.53125 | 10.42 |
| 44941.541666666664 | 10.5 |
| 44941.552083333336 | 10.53 |
| 44941.5625 | 10.55 |
| 44941.572916666664 | 10.47 |
| 44941.583333333336 | 10.48 |
| 44941.59375 | 10.48 |
| 44941.604166666664 | 10.49 |
| 44941.614583333336 | 10.52 |
| 44941.625 | 10.55 |
| 44941.635416666664 | 10.58 |
| 44941.645833333336 | 10.61 |
| 44941.65625 | 10.64 |
| 44941.666666666664 | 10.68 |
| 44941.677083333336 | 10.71 |
| 44941.6875 | 10.75 |
| 44941.697916666664 | 10.78 |
| 44941.708333333336 | 10.8 |
| 44941.71875 | 10.82 |
| 44941.729166666664 | 10.84 |
| 44941.739583333336 | 10.85 |
| 44941.75 | 10.88 |
| 44941.760416666664 | 10.9 |
| 44941.770833333336 | 10.9 |
| 44941.78125 | 10.91 |
| 44941.791666666664 | 10.92 |
| 44941.802083333336 | 10.93 |
| 44941.8125 | 10.94 |
| 44941.822916666664 | 11 |
| 44941.833333333336 | 11.01 |
| 44941.84375 | 11 |
| 44941.854166666664 | 10.99 |
| 44941.864583333336 | 11.03 |
| 44941.875 | 11.05 |
| 44941.885416666664 | 11.11 |
| 44941.895833333336 | 11.13 |
| 44941.90625 | 11.17 |
| 44941.916666666664 | 11.18 |
| 44941.927083333336 | 11.18 |
| 44941.9375 | 11.2 |
| 44941.947916666664 | 11.22 |
| 44941.958333333336 | 11.25 |
| 44941.96875 | 11.21 |
| 44941.979166666664 | 11.21 |
| 44941.989583333336 | 11.2 |
| 44942.0 | 11.19 |
| 44942.010416666664 | 11.17 |
| 44942.020833333336 | 11.17 |
| 44942.03125 | 11.15 |
| 44942.041666666664 | 11.11 |
| 44942.052083333336 | 11.11 |
| 44942.0625 | 11.12 |
| 44942.072916666664 | 11.12 |
| 44942.083333333336 | 11.1 |
| 44942.09375 | 11.07 |
| 44942.104166666664 | 11.06 |
| 44942.114583333336 | 11.05 |
| 44942.125 | 11.03 |
| 44942.135416666664 | 11.02 |
| 44942.145833333336 | 11 |
| 44942.15625 | 10.98 |
| 44942.166666666664 | 10.92 |
| 44942.177083333336 | 10.89 |
| 44942.1875 | 10.88 |
| 44942.197916666664 | 10.87 |
| 44942.208333333336 | 10.86 |
| 44942.21875 | 10.85 |
| 44942.229166666664 | 10.84 |
| 44942.239583333336 | 10.82 |
| 44942.25 | 10.81 |
| 44942.260416666664 | 10.79 |
| 44942.270833333336 | 10.77 |
| 44942.28125 | 10.75 |
| 44942.291666666664 | 10.73 |
| 44942.302083333336 | 10.71 |
| 44942.3125 | 10.69 |
| 44942.322916666664 | 10.68 |
| 44942.333333333336 | 10.66 |
| 44942.34375 | 10.63 |
| 44942.354166666664 | 10.63 |
| 44942.364583333336 | 10.64 |
| 44942.375 | 10.51 |
| 44942.385416666664 | 10.66 |
| 44942.395833333336 | 10.6 |
| 44942.40625 | 10.56 |
| 44942.416666666664 | 10.5 |
| 44942.427083333336 | 10.59 |
| 44942.4375 | 10.61 |
| 44942.447916666664 | 10.6 |
| 44942.458333333336 | 10.64 |
| 44942.46875 | 10.67 |
| 44942.479166666664 | 10.62 |
| 44942.489583333336 | 10.62 |
| 44942.5 | 10.61 |
| 44942.510416666664 | 10.58 |
| 44942.520833333336 | 10.54 |
| 44942.53125 | 10.53 |
| 44942.541666666664 | 10.53 |
| 44942.552083333336 | 10.53 |
| 44942.5625 | 10.55 |
| 44942.572916666664 | 10.63 |
| 44942.583333333336 | 10.68 |
| 44942.59375 | 10.73 |
| 44942.604166666664 | 10.74 |
| 44942.614583333336 | 10.77 |
| 44942.625 | 10.78 |
| 44942.635416666664 | 10.8 |
| 44942.645833333336 | 10.8 |
| 44942.65625 | 10.82 |
| 44942.666666666664 | 10.84 |
| 44942.677083333336 | 10.84 |
| 44942.6875 | 10.87 |
| 44942.697916666664 | 10.9 |
| 44942.708333333336 | 10.94 |
| 44942.71875 | 10.94 |
| 44942.729166666664 | 10.92 |
| 44942.739583333336 | 10.94 |
| 44942.75 | 10.96 |
| 44942.760416666664 | 10.99 |
| 44942.770833333336 | 11 |
| 44942.78125 | 11.02 |
| 44942.791666666664 | 11.05 |
| 44942.802083333336 | 11.08 |
| 44942.8125 | 11.09 |
| 44942.822916666664 | 11.11 |
| 44942.833333333336 | 11.11 |
| 44942.84375 | 11.12 |
| 44942.854166666664 | 11.15 |
| 44942.864583333336 | 11.16 |
| 44942.875 | 11.2 |
| 44942.885416666664 | 11.23 |
| 44942.895833333336 | 11.22 |
| 44942.90625 | 11.23 |
| 44942.916666666664 | 11.31 |
| 44942.927083333336 | 11.25 |
| 44942.9375 | 11.28 |
| 44942.947916666664 | 11.25 |
| 44942.958333333336 | 11.22 |
| 44942.96875 | 11.21 |
| 44942.979166666664 | 11.23 |
| 44942.989583333336 | 11.27 |
| 44943.0 | 11.26 |
| 44943.010416666664 | 11.3 |
| 44943.020833333336 | 11.31 |
| 44943.03125 | 11.31 |
| 44943.041666666664 | 11.31 |
| 44943.052083333336 | 11.38 |
| 44943.0625 | 11.42 |
| 44943.072916666664 | 11.44 |
| 44943.083333333336 | 11.46 |
| 44943.09375 | 11.45 |
| 44943.104166666664 | 11.43 |
| 44943.114583333336 | 11.43 |
| 44943.125 | 11.37 |
| 44943.135416666664 | 11.36 |
| 44943.145833333336 | 11.34 |
| 44943.15625 | 11.31 |
| 44943.166666666664 | 11.29 |
| 44943.177083333336 | 11.25 |
| 44943.1875 | 11.22 |
| 44943.197916666664 | 11.18 |
| 44943.208333333336 | 11.1 |
| 44943.21875 | 10.98 |
| 44943.229166666664 | 10.92 |
| 44943.239583333336 | 10.91 |
| 44943.25 | 10.92 |
| 44943.260416666664 | 10.91 |
| 44943.270833333336 | 10.91 |
| 44943.28125 | 10.91 |
| 44943.291666666664 | 10.91 |
| 44943.302083333336 | 10.89 |
| 44943.3125 | 10.84 |
| 44943.322916666664 | 10.81 |
| 44943.333333333336 | 10.79 |
| 44943.34375 | 10.76 |
| 44943.354166666664 | 10.74 |
| 44943.364583333336 | 10.72 |
| 44943.375 | 10.68 |
| 44943.385416666664 | 10.67 |
| 44943.395833333336 | 10.65 |
| 44943.40625 | 10.64 |
| 44943.416666666664 | 10.68 |
| 44943.427083333336 | 10.67 |
| 44943.4375 | 10.67 |
| 44943.447916666664 | 10.67 |
| 44943.458333333336 | 10.66 |
| 44943.46875 | 10.68 |
| 44943.479166666664 | 10.65 |
| 44943.489583333336 | 10.64 |
| 44943.5 | 10.61 |
| 44943.510416666664 | 10.58 |
| 44943.520833333336 | 10.53 |
| 44943.53125 | 10.51 |
| 44943.541666666664 | 10.47 |
| 44943.552083333336 | 10.53 |
| 44943.5625 | 10.62 |
| 44943.572916666664 | 10.68 |
| 44943.583333333336 | 10.73 |
| 44943.59375 | 10.76 |
| 44943.604166666664 | 10.79 |
| 44943.614583333336 | 10.81 |
| 44943.625 | 10.82 |
| 44943.635416666664 | 10.84 |
| 44943.645833333336 | 10.86 |
| 44943.65625 | 10.88 |
| 44943.666666666664 | 10.89 |
| 44943.677083333336 | 10.88 |
| 44943.6875 | 10.9 |
| 44943.697916666664 | 10.92 |
| 44943.708333333336 | 10.9 |
| 44943.71875 | 10.9 |
| 44943.729166666664 | 10.93 |
| 44943.739583333336 | 10.98 |
| 44943.75 | 10.99 |
| 44943.760416666664 | 10.99 |
| 44943.770833333336 | 10.97 |
| 44943.78125 | 10.99 |
| 44943.791666666664 | 11.01 |
| 44943.802083333336 | 11.03 |
| 44943.8125 | 11.04 |
| 44943.822916666664 | 11.05 |
| 44943.833333333336 | 11.07 |
| 44943.84375 | 11.09 |
| 44943.854166666664 | 11.1 |
| 44943.864583333336 | 11.11 |
| 44943.875 | 11.12 |
| 44943.885416666664 | 11.13 |
| 44943.895833333336 | 11.12 |
| 44943.90625 | 11.18 |
| 44943.916666666664 | 11.17 |
| 44943.927083333336 | 11.16 |
| 44943.9375 | 11.17 |
| 44943.947916666664 | 11.15 |
| 44943.958333333336 | 11.12 |
| 44943.96875 | 11.09 |
| 44943.979166666664 | 11.11 |
| 44943.989583333336 | 11.07 |
| 44944.0 | 11.04 |
| 44944.010416666664 | 11.01 |
| 44944.020833333336 | 10.99 |
| 44944.03125 | 10.99 |
| 44944.041666666664 | 11.09 |
| 44944.052083333336 | 11.15 |
| 44944.0625 | 11.19 |
| 44944.072916666664 | 11.2 |
| 44944.083333333336 | 11.19 |
| 44944.09375 | 11.19 |
| 44944.104166666664 | 11.17 |
| 44944.114583333336 | 11.16 |
| 44944.125 | 11.15 |
| 44944.135416666664 | 11.16 |
| 44944.145833333336 | 11.11 |
| 44944.15625 | 11.11 |
| 44944.166666666664 | 11.08 |
| 44944.177083333336 | 11.06 |
| 44944.1875 | 11.04 |
| 44944.197916666664 | 11.03 |
| 44944.208333333336 | 11.01 |
| 44944.21875 | 10.94 |
| 44944.229166666664 | 10.87 |
| 44944.239583333336 | 10.78 |
| 44944.25 | 10.73 |
| 44944.260416666664 | 10.68 |
| 44944.270833333336 | 10.63 |
| 44944.28125 | 10.58 |
| 44944.291666666664 | 10.55 |
| 44944.302083333336 | 10.52 |
| 44944.3125 | 10.5 |
| 44944.322916666664 | 10.5 |
| 44944.333333333336 | 10.49 |
| 44944.34375 | 10.46 |
| 44944.354166666664 | 10.45 |
| 44944.364583333336 | 10.44 |
| 44944.375 | 10.44 |
| 44944.385416666664 | 10.44 |
| 44944.395833333336 | 10.46 |
| 44944.40625 | 10.49 |
| 44944.416666666664 | 10.49 |
| 44944.427083333336 | 10.49 |
| 44944.4375 | 10.41 |
| 44944.447916666664 | 10.42 |
| 44944.458333333336 | 10.46 |
| 44944.46875 | 10.45 |
| 44944.479166666664 | 10.41 |
| 44944.489583333336 | 10.39 |
| 44944.5 | 10.33 |
| 44944.510416666664 | 10.33 |
| 44944.520833333336 | 10.28 |
| 44944.53125 | 10.29 |
| 44944.541666666664 | 10.23 |
| 44944.552083333336 | 10.2 |
| 44944.5625 | 10.2 |
| 44944.572916666664 | 10.26 |
| 44944.583333333336 | 10.26 |
| 44944.59375 | 10.37 |
| 44944.604166666664 | 10.42 |
| 44944.614583333336 | 10.48 |
| 44944.625 | 10.54 |
| 44944.635416666664 | 10.6 |
| 44944.645833333336 | 10.65 |
| 44944.65625 | 10.69 |
| 44944.666666666664 | 10.73 |
| 44944.677083333336 | 10.75 |
| 44944.6875 | 10.79 |
| 44944.697916666664 | 10.87 |
| 44944.708333333336 | 10.88 |
| 44944.71875 | 10.93 |
| 44944.729166666664 | 10.92 |
| 44944.739583333336 | 10.93 |
| 44944.75 | 10.95 |
| 44944.760416666664 | 10.99 |
| 44944.770833333336 | 11 |
| 44944.78125 | 11.02 |
| 44944.791666666664 | 11.04 |
| 44944.802083333336 | 11.03 |
| 44944.8125 | 10.65 |
| 44944.822916666664 | 10.63 |
| 44944.833333333336 | 10.58 |
| 44944.84375 | 10.57 |
| 44944.854166666664 | 10.56 |
| 44944.864583333336 | 10.52 |
| 44944.875 | 10.54 |
| 44944.885416666664 | 10.56 |
| 44944.895833333336 | 10.54 |
| 44944.90625 | 10.5 |
| 44944.916666666664 | 10.51 |
| 44944.927083333336 | 10.54 |
| 44944.9375 | 10.54 |
| 44944.947916666664 | 10.52 |
| 44944.958333333336 | 10.6 |
| 44944.96875 | 10.52 |
| 44944.979166666664 | 10.47 |
| 44944.989583333336 | 10.47 |
| 44945.0 | 10.42 |
| 44945.010416666664 | 10.38 |
| 44945.020833333336 | 10.32 |
| 44945.03125 | 10.31 |
| 44945.041666666664 | 10.28 |
| 44945.052083333336 | 10.35 |
| 44945.0625 | 10.46 |
| 44945.072916666664 | 10.52 |
| 44945.083333333336 | 10.52 |
| 44945.09375 | 10.54 |
| 44945.104166666664 | 10.49 |
| 44945.114583333336 | 10.47 |
| 44945.125 | 10.4 |
| 44945.135416666664 | 10.33 |
| 44945.145833333336 | 10.31 |
| 44945.15625 | 10.31 |
| 44945.166666666664 | 10.3 |
| 44945.177083333336 | 10.34 |
| 44945.1875 | 10.37 |
| 44945.197916666664 | 10.33 |
| 44945.208333333336 | 10.31 |
| 44945.21875 | 10.29 |
| 44945.229166666664 | 10.26 |
| 44945.239583333336 | 10.24 |
| 44945.25 | 10.19 |
| 44945.260416666664 | 10.13 |
| 44945.270833333336 | 10.06 |
| 44945.28125 | 9.98 |
| 44945.291666666664 | 9.9 |
| 44945.302083333336 | 9.86 |
| 44945.3125 | 9.81 |
| 44945.322916666664 | 9.77 |
| 44945.333333333336 | 9.76 |
| 44945.34375 | 9.79 |
| 44945.354166666664 | 9.82 |
| 44945.364583333336 | 9.84 |
| 44945.375 | 9.87 |
| 44945.385416666664 | 9.87 |
| 44945.395833333336 | 9.87 |
| 44945.40625 | 9.84 |
| 44945.416666666664 | 9.82 |
| 44945.427083333336 | 9.8 |
| 44945.4375 | 9.78 |
| 44945.447916666664 | 9.78 |
| 44945.458333333336 | 9.79 |
| 44945.46875 | 9.78 |
| 44945.479166666664 | 9.75 |
| 44945.489583333336 | 9.72 |
| 44945.5 | 9.84 |
| 44945.510416666664 | 9.76 |
| 44945.520833333336 | 9.75 |
| 44945.53125 | 9.71 |
| 44945.541666666664 | 9.66 |
| 44945.552083333336 | 9.64 |
| 44945.5625 | 9.61 |
| 44945.572916666664 | 9.59 |
| 44945.583333333336 | 9.53 |
| 44945.59375 | 9.47 |
| 44945.604166666664 | 9.44 |
| 44945.614583333336 | 9.42 |
| 44945.625 | 9.5 |
| 44945.635416666664 | 9.52 |
| 44945.645833333336 | 9.56 |
| 44945.65625 | 9.61 |
| 44945.666666666664 | 9.67 |
| 44945.677083333336 | 9.73 |
| 44945.6875 | 9.78 |
| 44945.697916666664 | 9.82 |
| 44945.708333333336 | 9.87 |
| 44945.71875 | 9.89 |
| 44945.729166666664 | 9.93 |
| 44945.739583333336 | 9.97 |
| 44945.75 | 10 |
| 44945.760416666664 | 10.01 |
| 44945.770833333336 | 10.02 |
| 44945.78125 | 10.05 |
| 44945.791666666664 | 10.1 |
| 44945.802083333336 | 10.14 |
| 44945.8125 | 10.19 |
| 44945.822916666664 | 10.21 |
| 44945.833333333336 | 10.19 |
| 44945.84375 | 10.17 |
| 44945.854166666664 | 10.15 |
| 44945.864583333336 | 10.14 |
| 44945.875 | 10.12 |
| 44945.885416666664 | 10.11 |
| 44945.895833333336 | 10.1 |
| 44945.90625 | 10.09 |
| 44945.916666666664 | 10.1 |
| 44945.927083333336 | 10.1 |
| 44945.9375 | 10.1 |
| 44945.947916666664 | 10.09 |
| 44945.958333333336 | 10.07 |
| 44945.96875 | 10.06 |
| 44945.979166666664 | 10.02 |
| 44945.989583333336 | 10.09 |
| 44946.0 | 10.03 |
| 44946.010416666664 | 9.97 |
| 44946.020833333336 | 9.87 |
| 44946.03125 | 9.74 |
| 44946.041666666664 | 9.74 |
| 44946.052083333336 | 9.68 |
| 44946.0625 | 9.63 |
| 44946.072916666664 | 9.49 |
| 44946.083333333336 | 9.49 |
| 44946.09375 | 9.46 |
| 44946.104166666664 | 9.33 |
| 44946.114583333336 | 9.36 |
| 44946.125 | 9.42 |
| 44946.135416666664 | 9.44 |
| 44946.145833333336 | 9.45 |
| 44946.15625 | 9.44 |
| 44946.166666666664 | 9.43 |
| 44946.177083333336 | 9.4 |
| 44946.1875 | 9.37 |
| 44946.197916666664 | 9.34 |
| 44946.208333333336 | 9.31 |
| 44946.21875 | 9.3 |
| 44946.229166666664 | 9.3 |
| 44946.239583333336 | 9.27 |
| 44946.25 | 9.26 |
| 44946.260416666664 | 9.24 |
| 44946.270833333336 | 9.27 |
| 44946.28125 | 9.27 |
| 44946.291666666664 | 9.26 |
| 44946.302083333336 | 9.26 |
| 44946.3125 | 9.22 |
| 44946.322916666664 | 9.2 |
| 44946.333333333336 | 9.18 |
| 44946.34375 | 9.13 |
| 44946.354166666664 | 9.12 |
| 44946.364583333336 | 9.12 |
| 44946.375 | 9.15 |
| 44946.385416666664 | 9.21 |
| 44946.395833333336 | 9.28 |
| 44946.40625 | 9.32 |
| 44946.416666666664 | 9.35 |
| 44946.427083333336 | 9.37 |
| 44946.4375 | 9.36 |
| 44946.447916666664 | 9.33 |
| 44946.458333333336 | 9.31 |
| 44946.46875 | 9.28 |
| 44946.479166666664 | 9.27 |
| 44946.489583333336 | 9.26 |
| 44946.5 | 9.27 |
| 44946.510416666664 | 9.25 |
| 44946.520833333336 | 9.24 |
| 44946.53125 | 9.18 |
| 44946.541666666664 | 9.14 |
| 44946.552083333336 | 9.19 |
| 44946.5625 | 9.16 |
| 44946.572916666664 | 9.14 |
| 44946.583333333336 | 9.13 |
| 44946.59375 | 9.13 |
| 44946.604166666664 | 9.14 |
| 44946.614583333336 | 9.13 |
| 44946.625 | 9.16 |
| 44946.635416666664 | 9.19 |
| 44946.645833333336 | 9.22 |
| 44946.65625 | 9.25 |
| 44946.666666666664 | 9.29 |
| 44946.677083333336 | 9.29 |
| 44946.6875 | 9.25 |
| 44946.697916666664 | 9.23 |
| 44946.708333333336 | 9.23 |
| 44946.71875 | 9.26 |
| 44946.729166666664 | 9.22 |
| 44946.739583333336 | 9.2 |
| 44946.75 | 9.21 |
| 44946.760416666664 | 9.2 |
| 44946.770833333336 | 9.21 |
| 44946.78125 | 9.26 |
| 44946.791666666664 | 9.33 |
| 44946.802083333336 | 9.3 |
| 44946.8125 | 9.3 |
| 44946.822916666664 | 9.33 |
| 44946.833333333336 | 9.43 |
| 44946.84375 | 9.52 |
| 44946.854166666664 | 9.54 |
| 44946.864583333336 | 9.61 |
| 44946.875 | 9.66 |
| 44946.885416666664 | 9.67 |
| 44946.895833333336 | 9.65 |
| 44946.90625 | 9.63 |
| 44946.916666666664 | 9.6 |
| 44946.927083333336 | 9.59 |
| 44946.9375 | 9.59 |
| 44946.947916666664 | 9.59 |
| 44946.958333333336 | 9.59 |
| 44946.96875 | 9.6 |
| 44946.979166666664 | 9.58 |
| 44946.989583333336 | 9.57 |
| 44947.0 | 9.53 |
| 44947.010416666664 | 9.51 |
| 44947.020833333336 | 9.54 |
| 44947.03125 | 9.5 |
| 44947.041666666664 | 9.42 |
| 44947.052083333336 | 9.39 |
| 44947.0625 | 9.34 |
| 44947.072916666664 | 9.31 |
| 44947.083333333336 | 9.26 |
| 44947.09375 | 9.24 |
| 44947.104166666664 | 9.14 |
| 44947.114583333336 | 9.07 |
| 44947.125 | 9.07 |
| 44947.135416666664 | 9.05 |
| 44947.145833333336 | 9.07 |
| 44947.15625 | 9.08 |
| 44947.166666666664 | 9.11 |
| 44947.177083333336 | 9.11 |
| 44947.1875 | 9.12 |
| 44947.197916666664 | 9.1 |
| 44947.208333333336 | 9.08 |
| 44947.21875 | 9.05 |
| 44947.229166666664 | 9.07 |
| 44947.239583333336 | 9.05 |
| 44947.25 | 8.97 |
| 44947.260416666664 | 8.97 |
| 44947.270833333336 | 9.02 |
| 44947.28125 | 8.97 |
| 44947.291666666664 | 8.96 |
| 44947.302083333336 | 9 |
| 44947.3125 | 8.98 |
| 44947.322916666664 | 8.98 |
| 44947.333333333336 | 9 |
| 44947.34375 | 9.03 |
| 44947.354166666664 | 9.09 |
| 44947.364583333336 | 9.08 |
| 44947.375 | 9.03 |
| 44947.385416666664 | 9.02 |
| 44947.395833333336 | 9.03 |
| 44947.40625 | 9.08 |
| 44947.416666666664 | 9.14 |
| 44947.427083333336 | 9.17 |
| 44947.4375 | 9.2 |
| 44947.447916666664 | 9.23 |
| 44947.458333333336 | 9.25 |
| 44947.46875 | 9.26 |
| 44947.479166666664 | 9.25 |
| 44947.489583333336 | 9.22 |
| 44947.5 | 9.19 |
| 44947.510416666664 | 9.18 |
| 44947.520833333336 | 9.19 |
| 44947.53125 | 9.2 |
| 44947.541666666664 | 9.22 |
| 44947.552083333336 | 9.23 |
| 44947.5625 | 9.23 |
| 44947.572916666664 | 9.18 |
| 44947.583333333336 | 9.25 |
| 44947.59375 | 9.27 |
| 44947.604166666664 | 9.3 |
| 44947.614583333336 | 9.33 |
| 44947.625 | 9.35 |
| 44947.635416666664 | 9.38 |
| 44947.645833333336 | 9.41 |
| 44947.65625 | 9.42 |
| 44947.666666666664 | 9.48 |
| 44947.677083333336 | 9.55 |
| 44947.6875 | 9.62 |
| 44947.697916666664 | 9.63 |
| 44947.708333333336 | 9.63 |
| 44947.71875 | 9.68 |
| 44947.729166666664 | 9.67 |
| 44947.739583333336 | 9.67 |
| 44947.75 | 9.63 |
| 44947.760416666664 | 9.61 |
| 44947.770833333336 | 9.63 |
| 44947.78125 | 9.61 |
| 44947.791666666664 | 9.63 |
| 44947.802083333336 | 9.65 |
| 44947.8125 | 9.66 |
| 44947.822916666664 | 9.69 |
| 44947.833333333336 | 9.7 |
| 44947.84375 | 9.65 |
| 44947.854166666664 | 9.62 |
| 44947.864583333336 | 9.61 |
| 44947.875 | 9.67 |
| 44947.885416666664 | 9.75 |
| 44947.895833333336 | 9.79 |
| 44947.90625 | 9.81 |
| 44947.916666666664 | 9.8 |
| 44947.927083333336 | 9.76 |
| 44947.9375 | 9.72 |
| 44947.947916666664 | 9.68 |
| 44947.958333333336 | 9.66 |
| 44947.96875 | 9.66 |
| 44947.979166666664 | 9.65 |
| 44947.989583333336 | 9.63 |
| 44948.0 | 9.64 |
| 44948.010416666664 | 9.64 |
| 44948.020833333336 | 9.63 |
| 44948.03125 | 9.61 |
| 44948.041666666664 | 9.6 |
| 44948.052083333336 | 9.58 |
| 44948.0625 | 9.57 |
| 44948.072916666664 | 9.59 |
| 44948.083333333336 | 9.56 |
| 44948.09375 | 9.54 |
| 44948.104166666664 | 9.53 |
| 44948.114583333336 | 9.5 |
| 44948.125 | 9.47 |
| 44948.135416666664 | 9.42 |
| 44948.145833333336 | 9.36 |
| 44948.15625 | 9.31 |
| 44948.166666666664 | 9.22 |
| 44948.177083333336 | 9.16 |
| 44948.1875 | 9.13 |
| 44948.197916666664 | 9.11 |
| 44948.208333333336 | 9.1 |
| 44948.21875 | 9.18 |
| 44948.229166666664 | 9.21 |
| 44948.239583333336 | 9.21 |
| 44948.25 | 9.2 |
| 44948.260416666664 | 9.21 |
| 44948.270833333336 | 9.21 |
| 44948.28125 | 9.19 |
| 44948.291666666664 | 9.15 |
| 44948.302083333336 | 9.13 |
| 44948.3125 | 9.15 |
| 44948.322916666664 | 9.15 |
| 44948.333333333336 | 9.14 |
| 44948.34375 | 9.13 |
| 44948.354166666664 | 9.14 |
| 44948.364583333336 | 9.15 |
| 44948.375 | 9.14 |
| 44948.385416666664 | 9.12 |
| 44948.395833333336 | 9.09 |
| 44948.40625 | 9.04 |
| 44948.416666666664 | 9.01 |
| 44948.427083333336 | 9 |
| 44948.4375 | 8.99 |
| 44948.447916666664 | 9.01 |
| 44948.458333333336 | 9.05 |
| 44948.46875 | 9.1 |
| 44948.479166666664 | 9.14 |
| 44948.489583333336 | 9.17 |
| 44948.5 | 9.2 |
| 44948.510416666664 | 9.17 |
| 44948.520833333336 | 9.16 |
| 44948.53125 | 9.17 |
| 44948.541666666664 | 9.2 |
| 44948.552083333336 | 9.24 |
| 44948.5625 | 9.3 |
| 44948.572916666664 | 9.3 |
| 44948.583333333336 | 9.34 |
| 44948.59375 | 9.32 |
| 44948.604166666664 | 9.33 |
| 44948.614583333336 | 9.2 |
| 44948.625 | 9.25 |
| 44948.635416666664 | 9.35 |
| 44948.645833333336 | 9.31 |
| 44948.65625 | 9.29 |
| 44948.666666666664 | 9.26 |
| 44948.677083333336 | 9.25 |
| 44948.6875 | 9.22 |
| 44948.697916666664 | 9.21 |
| 44948.708333333336 | 9.2 |
| 44948.71875 | 9.2 |
| 44948.729166666664 | 9.16 |
| 44948.739583333336 | 9.23 |
| 44948.75 | 9.25 |
| 44948.760416666664 | 9.27 |
| 44948.770833333336 | 9.27 |
| 44948.78125 | 9.25 |
| 44948.791666666664 | 9.26 |
| 44948.802083333336 | 9.26 |
| 44948.8125 | 9.27 |
| 44948.822916666664 | 9.26 |
| 44948.833333333336 | 9.26 |
| 44948.84375 | 9.25 |
| 44948.854166666664 | 9.26 |
| 44948.864583333336 | 9.26 |
| 44948.875 | 9.24 |
| 44948.885416666664 | 9.23 |
| 44948.895833333336 | 9.21 |
| 44948.90625 | 9.25 |
| 44948.916666666664 | 9.28 |
| 44948.927083333336 | 9.3 |
| 44948.9375 | 9.32 |
| 44948.947916666664 | 9.33 |
| 44948.958333333336 | 9.28 |
| 44948.96875 | 9.28 |
| 44948.979166666664 | 9.3 |
| 44948.989583333336 | 9.33 |
| 44949.0 | 9.36 |
| 44949.010416666664 | 9.36 |
| 44949.020833333336 | 9.37 |
| 44949.03125 | 9.38 |
| 44949.041666666664 | 9.39 |
| 44949.052083333336 | 9.38 |
| 44949.0625 | 9.36 |
| 44949.072916666664 | 9.35 |
| 44949.083333333336 | 9.33 |
| 44949.09375 | 9.31 |
| 44949.104166666664 | 9.31 |
| 44949.114583333336 | 9.32 |
| 44949.125 | 9.3 |
| 44949.135416666664 | 9.31 |
| 44949.145833333336 | 9.27 |
| 44949.15625 | 9.26 |
| 44949.166666666664 | 9.24 |
| 44949.177083333336 | 9.23 |
| 44949.1875 | 9.19 |
| 44949.197916666664 | 9.17 |
| 44949.208333333336 | 9.13 |
| 44949.21875 | 9.11 |
| 44949.229166666664 | 9.1 |
| 44949.239583333336 | 9.08 |
| 44949.25 | 9.06 |
| 44949.260416666664 | 9.03 |
| 44949.270833333336 | 8.99 |
| 44949.28125 | 8.95 |
| 44949.291666666664 | 8.91 |
| 44949.302083333336 | 8.87 |
| 44949.3125 | 8.86 |
| 44949.322916666664 | 8.86 |
| 44949.333333333336 | 8.92 |
| 44949.34375 | 8.92 |
| 44949.354166666664 | 8.9 |
| 44949.364583333336 | 8.89 |
| 44949.375 | 8.88 |
| 44949.385416666664 | 8.9 |
| 44949.395833333336 | 8.91 |
| 44949.40625 | 8.94 |
| 44949.416666666664 | 8.95 |
| 44949.427083333336 | 8.95 |
| 44949.4375 | 8.94 |
| 44949.447916666664 | 8.93 |
| 44949.458333333336 | 8.92 |
| 44949.46875 | 8.93 |
| 44949.479166666664 | 8.95 |
| 44949.489583333336 | 8.98 |
| 44949.5 | 9.01 |
| 44949.510416666664 | 9.07 |
| 44949.520833333336 | 9.1 |
| 44949.53125 | 9.13 |
| 44949.541666666664 | 9.14 |
| 44949.552083333336 | 9.13 |
| 44949.5625 | 9.13 |
| 44949.572916666664 | 9.13 |
| 44949.583333333336 | 9.14 |
| 44949.59375 | 9.16 |
| 44949.604166666664 | 9.17 |
| 44949.614583333336 | 9.19 |
| 44949.625 | 9.22 |
| 44949.635416666664 | 9.13 |
| 44949.645833333336 | 9.21 |
| 44949.65625 | 9.28 |
| 44949.666666666664 | 9.31 |
| 44949.677083333336 | 9.34 |
| 44949.6875 | 9.38 |
| 44949.697916666664 | 9.4 |
| 44949.708333333336 | 9.41 |
| 44949.71875 | 9.44 |
| 44949.729166666664 | 9.45 |
| 44949.739583333336 | 9.48 |
| 44949.75 | 9.51 |
| 44949.760416666664 | 9.58 |
| 44949.770833333336 | 9.62 |
| 44949.78125 | 9.63 |
| 44949.791666666664 | 9.69 |
| 44949.802083333336 | 9.71 |
| 44949.8125 | 9.69 |
| 44949.822916666664 | 9.7 |
| 44949.833333333336 | 9.72 |
| 44949.84375 | 9.73 |
| 44949.854166666664 | 9.74 |
| 44949.864583333336 | 9.75 |
| 44949.875 | 9.76 |
| 44949.885416666664 | 9.74 |
| 44949.895833333336 | 9.75 |
| 44949.90625 | 9.72 |
| 44949.916666666664 | 9.69 |
| 44949.927083333336 | 9.65 |
| 44949.9375 | 9.64 |
| 44949.947916666664 | 9.63 |
| 44949.958333333336 | 9.62 |
| 44949.96875 | 9.61 |
| 44949.979166666664 | 9.59 |
| 44949.989583333336 | 9.55 |
| 44950.0 | 9.51 |
| 44950.010416666664 | 9.48 |
| 44950.020833333336 | 9.47 |
| 44950.03125 | 9.45 |
| 44950.041666666664 | 9.45 |
| 44950.052083333336 | 9.44 |
| 44950.0625 | 9.44 |
| 44950.072916666664 | 9.43 |
| 44950.083333333336 | 9.43 |
| 44950.09375 | 9.44 |
| 44950.104166666664 | 9.43 |
| 44950.114583333336 | 9.43 |
| 44950.125 | 9.43 |
| 44950.135416666664 | 9.4 |
| 44950.145833333336 | 9.41 |
| 44950.15625 | 9.39 |
| 44950.166666666664 | 9.36 |
| 44950.177083333336 | 9.34 |
| 44950.1875 | 9.32 |
| 44950.197916666664 | 9.28 |
| 44950.208333333336 | 9.24 |
| 44950.21875 | 9.25 |
| 44950.229166666664 | 9.24 |
| 44950.239583333336 | 9.25 |
| 44950.25 | 9.26 |
| 44950.260416666664 | 9.33 |
| 44950.270833333336 | 9.36 |
| 44950.28125 | 9.37 |
| 44950.291666666664 | 9.35 |
| 44950.302083333336 | 9.32 |
| 44950.3125 | 9.32 |
| 44950.322916666664 | 9.33 |
| 44950.333333333336 | 9.35 |
| 44950.34375 | 9.35 |
| 44950.354166666664 | 9.36 |
| 44950.364583333336 | 9.33 |
| 44950.375 | 9.35 |
| 44950.385416666664 | 9.37 |
| 44950.395833333336 | 9.39 |
| 44950.40625 | 9.3 |
| 44950.416666666664 | 9.36 |
| 44950.427083333336 | 9.34 |
| 44950.4375 | 9.31 |
| 44950.447916666664 | 9.28 |
| 44950.458333333336 | 9.26 |
| 44950.46875 | 9.18 |
| 44950.479166666664 | 9.11 |
| 44950.489583333336 | 9.08 |
| 44950.5 | 9.07 |
| 44950.510416666664 | 9.08 |
| 44950.520833333336 | 9.1 |
| 44950.53125 | 9.13 |
| 44950.541666666664 | 9.16 |
| 44950.552083333336 | 9.2 |
| 44950.5625 | 9.24 |
| 44950.572916666664 | 9.3 |
| 44950.583333333336 | 9.33 |
| 44950.59375 | 9.36 |
| 44950.604166666664 | 9.37 |
| 44950.614583333336 | 9.39 |
| 44950.625 | 9.41 |
| 44950.635416666664 | 9.43 |
| 44950.645833333336 | 9.44 |
| 44950.65625 | 9.45 |
| 44950.666666666664 | 9.41 |
| 44950.677083333336 | 9.51 |
| 44950.6875 | 9.6 |
| 44950.697916666664 | 9.65 |
| 44950.708333333336 | 9.71 |
| 44950.71875 | 9.76 |
| 44950.729166666664 | 9.83 |
| 44950.739583333336 | 9.86 |
| 44950.75 | 9.9 |
| 44950.760416666664 | 9.99 |
| 44950.770833333336 | 10.06 |
| 44950.78125 | 10.02 |
| 44950.791666666664 | 10.1 |
| 44950.802083333336 | 10.14 |
| 44950.8125 | 10.18 |
| 44950.822916666664 | 10.09 |
| 44950.833333333336 | 10.04 |
| 44950.84375 | 10.14 |
| 44950.854166666664 | 10.1 |
| 44950.864583333336 | 10.13 |
| 44950.875 | 10.12 |
| 44950.885416666664 | 10.1 |
| 44950.895833333336 | 10.15 |
| 44950.90625 | 10.11 |
| 44950.916666666664 | 10.16 |
| 44950.927083333336 | 10.11 |
| 44950.9375 | 10.05 |
| 44950.947916666664 | 10.05 |
| 44950.958333333336 | 10.01 |
| 44950.96875 | 10.02 |
| 44950.979166666664 | 10.03 |
| 44950.989583333336 | 10.04 |
| 44951.0 | 10.03 |
| 44951.010416666664 | 9.99 |
| 44951.020833333336 | 9.94 |
| 44951.03125 | 9.9 |
| 44951.041666666664 | 9.87 |
| 44951.052083333336 | 9.82 |
| 44951.0625 | 9.79 |
| 44951.072916666664 | 9.77 |
| 44951.083333333336 | 9.76 |
| 44951.09375 | 9.74 |
| 44951.104166666664 | 9.72 |
| 44951.114583333336 | 9.7 |
| 44951.125 | 9.69 |
| 44951.135416666664 | 9.68 |
| 44951.145833333336 | 9.67 |
| 44951.15625 | 9.66 |
| 44951.166666666664 | 9.65 |
| 44951.177083333336 | 9.63 |
| 44951.1875 | 9.64 |
| 44951.197916666664 | 9.63 |
| 44951.208333333336 | 9.6 |
| 44951.21875 | 9.57 |
| 44951.229166666664 | 9.53 |
| 44951.239583333336 | 9.48 |
| 44951.25 | 9.46 |
| 44951.260416666664 | 9.45 |
| 44951.270833333336 | 9.47 |
| 44951.28125 | 9.48 |
| 44951.291666666664 | 9.56 |
| 44951.302083333336 | 9.61 |
| 44951.3125 | 9.61 |
| 44951.322916666664 | 9.63 |
| 44951.333333333336 | 9.62 |
| 44951.34375 | 9.59 |
| 44951.354166666664 | 9.57 |
| 44951.364583333336 | 9.56 |
| 44951.375 | 9.54 |
| 44951.385416666664 | 9.53 |
| 44951.395833333336 | 9.44 |
| 44951.40625 | 9.49 |
| 44951.416666666664 | 9.44 |
| 44951.427083333336 | 9.48 |
| 44951.4375 | 9.46 |
| 44951.447916666664 | 9.45 |
| 44951.458333333336 | 9.46 |
| 44951.46875 | 9.49 |
| 44951.479166666664 | 9.5 |
| 44951.489583333336 | 9.47 |
| 44951.5 | 9.45 |
| 44951.510416666664 | 9.38 |
| 44951.520833333336 | 9.26 |
| 44951.53125 | 9.19 |
| 44951.541666666664 | 9.15 |
| 44951.552083333336 | 9.15 |
| 44951.5625 | 9.15 |
| 44951.572916666664 | 9.18 |
| 44951.583333333336 | 9.24 |
| 44951.59375 | 9.29 |
| 44951.604166666664 | 9.36 |
| 44951.614583333336 | 9.42 |
| 44951.625 | 9.47 |
| 44951.635416666664 | 9.49 |
| 44951.645833333336 | 9.47 |
| 44951.65625 | 9.45 |
| 44951.666666666664 | 9.46 |
| 44951.677083333336 | 9.48 |
| 44951.6875 | 9.49 |
| 44951.697916666664 | 9.51 |
| 44951.708333333336 | 9.48 |
| 44951.71875 | 9.56 |
| 44951.729166666664 | 9.61 |
| 44951.739583333336 | 9.67 |
| 44951.75 | 9.7 |
| 44951.760416666664 | 9.73 |
| 44951.770833333336 | 9.74 |
| 44951.78125 | 9.76 |
| 44951.791666666664 | 9.78 |
| 44951.802083333336 | 9.77 |
| 44951.8125 | 9.76 |
| 44951.822916666664 | 9.78 |
| 44951.833333333336 | 9.76 |
| 44951.84375 | 9.76 |
| 44951.854166666664 | 9.73 |
| 44951.864583333336 | 9.71 |
| 44951.875 | 9.7 |
| 44951.885416666664 | 9.68 |
| 44951.895833333336 | 9.68 |
| 44951.90625 | 9.7 |
| 44951.916666666664 | 9.7 |
| 44951.927083333336 | 9.7 |
| 44951.9375 | 9.7 |
| 44951.947916666664 | 9.67 |
| 44951.958333333336 | 9.67 |
| 44951.96875 | 9.63 |
| 44951.979166666664 | 9.6 |
| 44951.989583333336 | 9.57 |
| 44952.0 | 9.57 |
| 44952.010416666664 | 9.53 |
| 44952.020833333336 | 9.51 |
| 44952.03125 | 9.49 |
| 44952.041666666664 | 9.48 |
| 44952.052083333336 | 9.46 |
| 44952.0625 | 9.45 |
| 44952.072916666664 | 9.43 |
| 44952.083333333336 | 9.44 |
| 44952.09375 | 9.43 |
| 44952.104166666664 | 9.44 |
| 44952.114583333336 | 9.44 |
| 44952.125 | 9.45 |
| 44952.135416666664 | 9.46 |
| 44952.145833333336 | 9.46 |
| 44952.15625 | 9.45 |
| 44952.166666666664 | 9.45 |
| 44952.177083333336 | 9.44 |
| 44952.1875 | 9.44 |
| 44952.197916666664 | 9.44 |
| 44952.208333333336 | 9.42 |
| 44952.21875 | 9.39 |
| 44952.229166666664 | 9.36 |
| 44952.239583333336 | 9.37 |
| 44952.25 | 9.37 |
| 44952.260416666664 | 9.34 |
| 44952.270833333336 | 9.23 |
| 44952.28125 | 9.18 |
| 44952.291666666664 | 9.12 |
| 44952.302083333336 | 9.09 |
| 44952.3125 | 9.04 |
| 44952.322916666664 | 9 |
| 44952.333333333336 | 8.97 |
| 44952.34375 | 8.93 |
| 44952.354166666664 | 8.98 |
| 44952.364583333336 | 9.01 |
| 44952.375 | 9.05 |
| 44952.385416666664 | 9.04 |
| 44952.395833333336 | 8.99 |
| 44952.40625 | 9.01 |
| 44952.416666666664 | 9.06 |
| 44952.427083333336 | 9.05 |
| 44952.4375 | 9.05 |
| 44952.447916666664 | 9.04 |
| 44952.458333333336 | 9.03 |
| 44952.46875 | 9.01 |
| 44952.479166666664 | 9.01 |
| 44952.489583333336 | 8.99 |
| 44952.5 | 8.99 |
| 44952.510416666664 | 9 |
| 44952.520833333336 | 9.01 |
| 44952.53125 | 9.01 |
| 44952.541666666664 | 8.99 |
| 44952.552083333336 | 8.99 |
| 44952.5625 | 8.99 |
| 44952.572916666664 | 9 |
| 44952.583333333336 | 9.01 |
| 44952.59375 | 9.03 |
| 44952.604166666664 | 9.05 |
| 44952.614583333336 | 9.07 |
| 44952.625 | 9.1 |
| 44952.635416666664 | 9.14 |
| 44952.645833333336 | 9.2 |
| 44952.65625 | 9.26 |
| 44952.666666666664 | 9.3 |
| 44952.677083333336 | 9.33 |
| 44952.6875 | 9.36 |
| 44952.697916666664 | 9.38 |
| 44952.708333333336 | 9.4 |
| 44952.71875 | 9.44 |
| 44952.729166666664 | 9.48 |
| 44952.739583333336 | 9.45 |
| 44952.75 | 9.45 |
| 44952.760416666664 | 9.51 |
| 44952.770833333336 | 9.56 |
| 44952.78125 | 9.66 |
| 44952.791666666664 | 9.67 |
| 44952.802083333336 | 9.68 |
| 44952.8125 | 9.71 |
| 44952.822916666664 | 9.76 |
| 44952.833333333336 | 9.82 |
| 44952.84375 | 9.8 |
| 44952.854166666664 | 9.76 |
| 44952.864583333336 | 9.76 |
| 44952.875 | 9.79 |
| 44952.885416666664 | 9.68 |
| 44952.895833333336 | 9.67 |
| 44952.90625 | 9.68 |
| 44952.916666666664 | 9.67 |
| 44952.927083333336 | 9.68 |
| 44952.9375 | 9.71 |
| 44952.947916666664 | 9.71 |
| 44952.958333333336 | 9.72 |
| 44952.96875 | 9.72 |
| 44952.979166666664 | 9.72 |
| 44952.989583333336 | 9.71 |
| 44953.0 | 9.64 |
| 44953.010416666664 | 9.61 |
| 44953.020833333336 | 9.59 |
| 44953.03125 | 9.57 |
| 44953.041666666664 | 9.54 |
| 44953.052083333336 | 9.53 |
| 44953.0625 | 9.5 |
| 44953.072916666664 | 9.44 |
| 44953.083333333336 | 9.4 |
| 44953.09375 | 9.35 |
| 44953.104166666664 | 9.29 |
| 44953.114583333336 | 9.22 |
| 44953.125 | 9.18 |
| 44953.135416666664 | 9.18 |
| 44953.145833333336 | 9.18 |
| 44953.15625 | 9.2 |
| 44953.166666666664 | 9.23 |
| 44953.177083333336 | 9.26 |
| 44953.1875 | 9.28 |
| 44953.197916666664 | 9.28 |
| 44953.208333333336 | 9.29 |
| 44953.21875 | 9.29 |
| 44953.229166666664 | 9.28 |
| 44953.239583333336 | 9.24 |
| 44953.25 | 9.24 |
| 44953.260416666664 | 9.25 |
| 44953.270833333336 | 9.21 |
| 44953.28125 | 9.19 |
| 44953.291666666664 | 9.19 |
| 44953.302083333336 | 9.18 |
| 44953.3125 | 9.15 |
| 44953.322916666664 | 9.01 |
| 44953.333333333336 | 8.99 |
| 44953.34375 | 9 |
| 44953.354166666664 | 9.02 |
| 44953.364583333336 | 9.02 |
| 44953.375 | 9.09 |
| 44953.385416666664 | 9.1 |
| 44953.395833333336 | 9.09 |
| 44953.40625 | 9.07 |
| 44953.416666666664 | 9.06 |
| 44953.427083333336 | 9.05 |
| 44953.4375 | 9.05 |
| 44953.447916666664 | 9.03 |
| 44953.458333333336 | 9 |
| 44953.46875 | 8.99 |
| 44953.479166666664 | 8.98 |
| 44953.489583333336 | 8.98 |
| 44953.5 | 8.99 |
| 44953.510416666664 | 8.99 |
| 44953.520833333336 | 8.99 |
| 44953.53125 | 8.95 |
| 44953.541666666664 | 8.95 |
| 44953.552083333336 | 8.94 |
| 44953.5625 | 8.95 |
| 44953.572916666664 | 8.96 |
| 44953.583333333336 | 8.96 |
| 44953.59375 | 8.95 |
| 44953.604166666664 | 8.98 |
| 44953.614583333336 | 9.02 |
| 44953.625 | 9.07 |
| 44953.635416666664 | 9.11 |
| 44953.645833333336 | 9.14 |
| 44953.65625 | 9.18 |
| 44953.666666666664 | 9.23 |
| 44953.677083333336 | 9.28 |
| 44953.6875 | 9.34 |
| 44953.697916666664 | 9.39 |
| 44953.708333333336 | 9.43 |
| 44953.71875 | 9.46 |
| 44953.729166666664 | 9.49 |
| 44953.739583333336 | 9.52 |
| 44953.75 | 9.55 |
| 44953.760416666664 | 9.56 |
| 44953.770833333336 | 9.58 |
| 44953.78125 | 9.61 |
| 44953.791666666664 | 9.67 |
| 44953.802083333336 | 9.7 |
| 44953.8125 | 9.84 |
| 44953.822916666664 | 9.95 |
| 44953.833333333336 | 9.98 |
| 44953.84375 | 9.93 |
| 44953.854166666664 | 10.01 |
| 44953.864583333336 | 9.79 |
| 44953.875 | 9.76 |
| 44953.885416666664 | 9.78 |
| 44953.895833333336 | 9.8 |
| 44953.90625 | 9.88 |
| 44953.916666666664 | 9.9 |
| 44953.927083333336 | 9.94 |
| 44953.9375 | 9.95 |
| 44953.947916666664 | 9.95 |
| 44953.958333333336 | 9.93 |
| 44953.96875 | 9.92 |
| 44953.979166666664 | 9.92 |
| 44953.989583333336 | 9.92 |
| 44954.0 | 9.93 |
| 44954.010416666664 | 9.93 |
| 44954.020833333336 | 9.89 |
| 44954.03125 | 9.84 |
| 44954.041666666664 | 9.78 |
| 44954.052083333336 | 9.76 |
| 44954.0625 | 9.73 |
| 44954.072916666664 | 9.72 |
| 44954.083333333336 | 9.72 |
| 44954.09375 | 9.72 |
| 44954.104166666664 | 9.67 |
| 44954.114583333336 | 9.6 |
| 44954.125 | 9.53 |
| 44954.135416666664 | 9.49 |
| 44954.145833333336 | 9.45 |
| 44954.15625 | 9.4 |
| 44954.166666666664 | 9.35 |
| 44954.177083333336 | 9.34 |
| 44954.1875 | 9.36 |
| 44954.197916666664 | 9.39 |
| 44954.208333333336 | 9.39 |
| 44954.21875 | 9.4 |
| 44954.229166666664 | 9.41 |
| 44954.239583333336 | 9.41 |
| 44954.25 | 9.41 |
| 44954.260416666664 | 9.41 |
| 44954.270833333336 | 9.41 |
| 44954.28125 | 9.41 |
| 44954.291666666664 | 9.33 |
| 44954.302083333336 | 9.37 |
| 44954.3125 | 9.36 |
| 44954.322916666664 | 9.35 |
| 44954.333333333336 | 9.33 |
| 44954.34375 | 9.3 |
| 44954.354166666664 | 9.25 |
| 44954.364583333336 | 9.2 |
| 44954.375 | 9.26 |
| 44954.385416666664 | 9.17 |
| 44954.395833333336 | 9.29 |
| 44954.40625 | 9.39 |
| 44954.416666666664 | 9.38 |
| 44954.427083333336 | 9.37 |
| 44954.4375 | 9.37 |
| 44954.447916666664 | 9.37 |
| 44954.458333333336 | 9.35 |
| 44954.46875 | 9.35 |
| 44954.479166666664 | 9.36 |
| 44954.489583333336 | 9.34 |
| 44954.5 | 9.34 |
| 44954.510416666664 | 9.33 |
| 44954.520833333336 | 9.33 |
| 44954.53125 | 9.33 |
| 44954.541666666664 | 9.32 |
| 44954.552083333336 | 9.32 |
| 44954.5625 | 9.33 |
| 44954.572916666664 | 9.32 |
| 44954.583333333336 | 9.33 |
| 44954.59375 | 9.36 |
| 44954.604166666664 | 9.35 |
| 44954.614583333336 | 9.36 |
| 44954.625 | 9.4 |
| 44954.635416666664 | 9.41 |
| 44954.645833333336 | 9.45 |
| 44954.65625 | 9.52 |
| 44954.666666666664 | 9.57 |
| 44954.677083333336 | 9.63 |
| 44954.6875 | 9.68 |
| 44954.697916666664 | 9.7 |
| 44954.708333333336 | 9.73 |
| 44954.71875 | 9.76 |
| 44954.729166666664 | 9.79 |
| 44954.739583333336 | 9.82 |
| 44954.75 | 9.84 |
| 44954.760416666664 | 9.85 |
| 44954.770833333336 | 9.86 |
| 44954.78125 | 9.89 |
| 44954.791666666664 | 9.89 |
| 44954.802083333336 | 9.95 |
| 44954.8125 | 10.02 |
| 44954.822916666664 | 9.99 |
| 44954.833333333336 | 10.09 |
| 44954.84375 | 10.26 |
| 44954.854166666664 | 10.34 |
| 44954.864583333336 | 10.34 |
| 44954.875 | 10.4 |
| 44954.885416666664 | 10.34 |
| 44954.895833333336 | 10.2 |
| 44954.90625 | 10.16 |
| 44954.916666666664 | 10.12 |
| 44954.927083333336 | 10.12 |
| 44954.9375 | 10.15 |
| 44954.947916666664 | 10.19 |
| 44954.958333333336 | 10.21 |
| 44954.96875 | 10.21 |
| 44954.979166666664 | 10.21 |
| 44954.989583333336 | 10.19 |
| 44955.0 | 10.18 |
| 44955.010416666664 | 10.17 |
| 44955.020833333336 | 10.16 |
| 44955.03125 | 10.16 |
| 44955.041666666664 | 10.17 |
| 44955.052083333336 | 10.16 |
| 44955.0625 | 10.15 |
| 44955.072916666664 | 10.06 |
| 44955.083333333336 | 10.01 |
| 44955.09375 | 9.97 |
| 44955.104166666664 | 9.97 |
| 44955.114583333336 | 9.97 |
| 44955.125 | 9.93 |
| 44955.135416666664 | 9.89 |
| 44955.145833333336 | 9.84 |
| 44955.15625 | 9.78 |
| 44955.166666666664 | 9.71 |
| 44955.177083333336 | 9.61 |
| 44955.1875 | 9.51 |
| 44955.197916666664 | 9.46 |
| 44955.208333333336 | 9.44 |
| 44955.21875 | 9.44 |
| 44955.229166666664 | 9.44 |
| 44955.239583333336 | 9.44 |
| 44955.25 | 9.45 |
| 44955.260416666664 | 9.46 |
| 44955.270833333336 | 9.46 |
| 44955.28125 | 9.46 |
| 44955.291666666664 | 9.46 |
| 44955.302083333336 | 9.46 |
| 44955.3125 | 9.44 |
| 44955.322916666664 | 9.39 |
| 44955.333333333336 | 9.4 |
| 44955.34375 | 9.41 |
| 44955.354166666664 | 9.38 |
| 44955.364583333336 | 9.37 |
| 44955.375 | 9.34 |
| 44955.385416666664 | 9.33 |
| 44955.395833333336 | 9.32 |
| 44955.40625 | 9.32 |
| 44955.416666666664 | 9.26 |
| 44955.427083333336 | 9.22 |
| 44955.4375 | 9.2 |
| 44955.447916666664 | 9.3 |
| 44955.458333333336 | 9.35 |
| 44955.46875 | 9.41 |
| 44955.479166666664 | 9.41 |
| 44955.489583333336 | 9.42 |
| 44955.5 | 9.4 |
| 44955.510416666664 | 9.4 |
| 44955.520833333336 | 9.39 |
| 44955.53125 | 9.39 |
| 44955.541666666664 | 9.4 |
| 44955.552083333336 | 9.4 |
| 44955.5625 | 9.4 |
| 44955.572916666664 | 9.43 |
| 44955.583333333336 | 9.45 |
| 44955.59375 | 9.45 |
| 44955.604166666664 | 9.46 |
| 44955.614583333336 | 9.45 |
| 44955.625 | 9.45 |
| 44955.635416666664 | 9.46 |
| 44955.645833333336 | 9.5 |
| 44955.65625 | 9.55 |
| 44955.666666666664 | 9.59 |
| 44955.677083333336 | 9.63 |
| 44955.6875 | 9.66 |
| 44955.697916666664 | 9.71 |
| 44955.708333333336 | 9.74 |
| 44955.71875 | 9.77 |
| 44955.729166666664 | 9.8 |
| 44955.739583333336 | 9.83 |
| 44955.75 | 9.85 |
| 44955.760416666664 | 9.85 |
| 44955.770833333336 | 9.82 |
| 44955.78125 | 9.79 |
| 44955.791666666664 | 9.79 |
| 44955.802083333336 | 9.8 |
| 44955.8125 | 9.81 |
| 44955.822916666664 | 9.81 |
| 44955.833333333336 | 9.88 |
| 44955.84375 | 9.95 |
| 44955.854166666664 | 9.94 |
| 44955.864583333336 | 10 |
| 44955.875 | 10 |
| 44955.885416666664 | 10.04 |
| 44955.895833333336 | 10.07 |
| 44955.90625 | 10.09 |
| 44955.916666666664 | 10.09 |
| 44955.927083333336 | 10.1 |
| 44955.9375 | 10.09 |
| 44955.947916666664 | 10.06 |
| 44955.958333333336 | 9.98 |
| 44955.96875 | 10.02 |
| 44955.979166666664 | 10.01 |
| 44955.989583333336 | 9.97 |
| 44956.0 | 9.99 |
| 44956.010416666664 | 10.01 |
| 44956.020833333336 | 10.02 |
| 44956.03125 | 10.05 |
| 44956.041666666664 | 10.04 |
| 44956.052083333336 | 10.04 |
| 44956.0625 | 10.03 |
| 44956.072916666664 | 10.03 |
| 44956.083333333336 | 10 |
| 44956.09375 | 10.02 |
| 44956.104166666664 | 9.95 |
| 44956.114583333336 | 9.89 |
| 44956.125 | 9.88 |
| 44956.135416666664 | 9.86 |
| 44956.145833333336 | 9.81 |
| 44956.15625 | 9.75 |
| 44956.166666666664 | 9.7 |
| 44956.177083333336 | 9.64 |
| 44956.1875 | 9.59 |
| 44956.197916666664 | 9.5 |
| 44956.208333333336 | 9.43 |
| 44956.21875 | 9.37 |
| 44956.229166666664 | 9.34 |
| 44956.239583333336 | 9.31 |
| 44956.25 | 9.28 |
| 44956.260416666664 | 9.27 |
| 44956.270833333336 | 9.26 |
| 44956.28125 | 9.26 |
| 44956.291666666664 | 9.28 |
| 44956.302083333336 | 9.3 |
| 44956.3125 | 9.31 |
| 44956.322916666664 | 9.31 |
| 44956.333333333336 | 9.31 |
| 44956.34375 | 9.31 |
| 44956.354166666664 | 9.3 |
| 44956.364583333336 | 9.3 |
| 44956.375 | 9.29 |
| 44956.385416666664 | 9.27 |
| 44956.395833333336 | 9.25 |
| 44956.40625 | 9.25 |
| 44956.416666666664 | 9.19 |
| 44956.427083333336 | 9.18 |
| 44956.4375 | 9.14 |
| 44956.447916666664 | 9.18 |
| 44956.458333333336 | 9.14 |
| 44956.46875 | 9.09 |
| 44956.479166666664 | 9 |
| 44956.489583333336 | 8.91 |
| 44956.5 | 8.87 |
| 44956.510416666664 | 8.96 |
| 44956.520833333336 | 8.96 |
| 44956.53125 | 8.99 |
| 44956.541666666664 | 9.05 |
| 44956.552083333336 | 9.07 |
| 44956.5625 | 9.07 |
| 44956.572916666664 | 9.07 |
| 44956.583333333336 | 9.06 |
| 44956.59375 | 9.06 |
| 44956.604166666664 | 9.08 |
| 44956.614583333336 | 9.08 |
| 44956.625 | 9.1 |
| 44956.635416666664 | 9.14 |
| 44956.645833333336 | 9.17 |
| 44956.65625 | 9.15 |
| 44956.666666666664 | 9.14 |
| 44956.677083333336 | 9.14 |
| 44956.6875 | 9.1 |
| 44956.697916666664 | 9.14 |
| 44956.708333333336 | 9.19 |
| 44956.71875 | 9.2 |
| 44956.729166666664 | 9.26 |
| 44956.739583333336 | 9.31 |
| 44956.75 | 9.38 |
| 44956.760416666664 | 9.45 |
| 44956.770833333336 | 9.51 |
| 44956.78125 | 9.57 |
| 44956.791666666664 | 9.6 |
| 44956.802083333336 | 9.62 |
| 44956.8125 | 9.66 |
| 44956.822916666664 | 9.7 |
| 44956.833333333336 | 9.73 |
| 44956.84375 | 9.73 |
| 44956.854166666664 | 9.75 |
| 44956.864583333336 | 9.72 |
| 44956.875 | 9.8 |
| 44956.885416666664 | 9.79 |
| 44956.895833333336 | 9.77 |
| 44956.90625 | 9.79 |
| 44956.916666666664 | 9.78 |
| 44956.927083333336 | 9.94 |
| 44956.9375 | 10.01 |
| 44956.947916666664 | 10.04 |
| 44956.958333333336 | 10.26 |
| 44956.96875 | 10.18 |
| 44956.979166666664 | 10.13 |
| 44956.989583333336 | 10.06 |
| 44957.0 | 9.99 |
| 44957.010416666664 | 9.97 |
| 44957.020833333336 | 9.86 |
| 44957.03125 | 9.87 |
| 44957.041666666664 | 9.76 |
| 44957.052083333336 | 9.73 |
| 44957.0625 | 9.72 |
| 44957.072916666664 | 9.74 |
| 44957.083333333336 | 9.76 |
| 44957.09375 | 9.76 |
| 44957.104166666664 | 9.73 |
| 44957.114583333336 | 9.72 |
| 44957.125 | 9.67 |
| 44957.135416666664 | 9.64 |
| 44957.145833333336 | 9.62 |
| 44957.15625 | 9.6 |
| 44957.166666666664 | 9.6 |
| 44957.177083333336 | 9.56 |
| 44957.1875 | 9.58 |
| 44957.197916666664 | 9.56 |
| 44957.208333333336 | 9.54 |
| 44957.21875 | 9.5 |
| 44957.229166666664 | 9.46 |
| 44957.239583333336 | 9.41 |
| 44957.25 | 9.37 |
| 44957.260416666664 | 9.33 |
| 44957.270833333336 | 9.29 |
| 44957.28125 | 9.25 |
| 44957.291666666664 | 9.2 |
| 44957.302083333336 | 9.14 |
| 44957.3125 | 9.11 |
| 44957.322916666664 | 9.12 |
| 44957.333333333336 | 9.13 |
| 44957.34375 | 9.14 |
| 44957.354166666664 | 9.15 |
| 44957.364583333336 | 9.15 |
| 44957.375 | 9.15 |
| 44957.385416666664 | 9.15 |
| 44957.395833333336 | 9.15 |
| 44957.40625 | 9.14 |
| 44957.416666666664 | 9.12 |
| 44957.427083333336 | 9.07 |
| 44957.4375 | 9.08 |
| 44957.447916666664 | 9.09 |
| 44957.458333333336 | 9.05 |
| 44957.46875 | 9 |
| 44957.479166666664 | 8.95 |
| 44957.489583333336 | 8.97 |
| 44957.5 | 8.95 |
| 44957.510416666664 | 8.82 |
| 44957.520833333336 | 8.76 |
| 44957.53125 | 8.75 |
| 44957.541666666664 | 8.74 |
| 44957.552083333336 | 8.93 |
| 44957.5625 | 9.03 |
| 44957.572916666664 | 9.03 |
| 44957.583333333336 | 9.01 |
| 44957.59375 | 9.01 |
| 44957.604166666664 | 9.03 |
| 44957.614583333336 | 9.04 |
| 44957.625 | 9.06 |
| 44957.635416666664 | 9.06 |
| 44957.645833333336 | 9.09 |
| 44957.65625 | 9.13 |
| 44957.666666666664 | 9.16 |
| 44957.677083333336 | 9.17 |
| 44957.6875 | 9.24 |
| 44957.697916666664 | 9.27 |
| 44957.708333333336 | 9.27 |
| 44957.71875 | 9.31 |
| 44957.729166666664 | 9.22 |
| 44957.739583333336 | 9.15 |
| 44957.75 | 9.1 |
| 44957.760416666664 | 9.14 |
| 44957.770833333336 | 9.2 |
| 44957.78125 | 9.27 |
| 44957.791666666664 | 9.35 |
| 44957.802083333336 | 9.4 |
| 44957.8125 | 9.43 |
| 44957.822916666664 | 9.45 |
| 44957.833333333336 | 9.47 |
| 44957.84375 | 9.48 |
| 44957.854166666664 | 9.48 |
| 44957.864583333336 | 9.48 |
| 44957.875 | 9.48 |
| 44957.885416666664 | 9.47 |
| 44957.895833333336 | 9.46 |
| 44957.90625 | 9.45 |
| 44957.916666666664 | 9.45 |
| 44957.927083333336 | 9.46 |
| 44957.9375 | 9.48 |
| 44957.947916666664 | 9.47 |
| 44957.958333333336 | 9.47 |
| 44957.96875 | 9.46 |
| 44957.979166666664 | 9.44 |
| 44957.989583333336 | 9.44 |
| 44958.0 | 9.39 |
| 44958.010416666664 | 9.35 |
| 44958.020833333336 | 9.3 |
| 44958.03125 | 9.27 |
| 44958.041666666664 | 9.24 |
| 44958.052083333336 | 9.23 |
| 44958.0625 | 9.25 |
| 44958.072916666664 | 9.24 |
| 44958.083333333336 | 9.29 |
| 44958.09375 | 9.31 |
| 44958.104166666664 | 9.36 |
| 44958.114583333336 | 9.35 |
| 44958.125 | 9.34 |
| 44958.135416666664 | 9.33 |
| 44958.145833333336 | 9.32 |